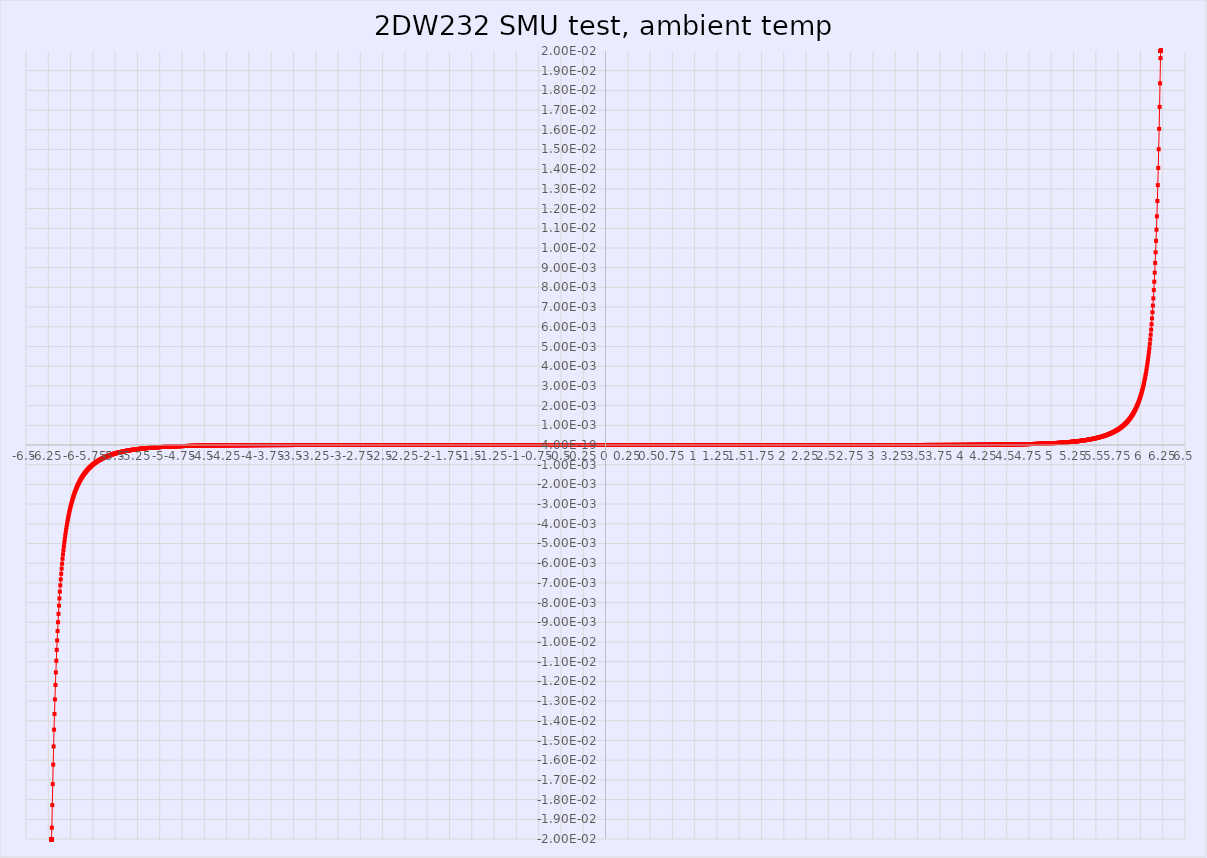
| Category | Series 0 |
|---|---|
| -6.214585 | -0.02 |
| -6.214633 | -0.02 |
| -6.214651 | -0.02 |
| -6.214634 | -0.02 |
| -6.214642 | -0.02 |
| -6.214635 | -0.02 |
| -6.214625 | -0.02 |
| -6.21463 | -0.02 |
| -6.21462 | -0.02 |
| -6.214613 | -0.02 |
| -6.214603 | -0.02 |
| -6.214599 | -0.02 |
| -6.214592 | -0.02 |
| -6.214594 | -0.02 |
| -6.214595 | -0.02 |
| -6.214583 | -0.02 |
| -6.214578 | -0.02 |
| -6.214571 | -0.02 |
| -6.214576 | -0.02 |
| -6.214564 | -0.02 |
| -6.214559 | -0.02 |
| -6.214559 | -0.02 |
| -6.214554 | -0.02 |
| -6.214546 | -0.02 |
| -6.214539 | -0.02 |
| -6.21454 | -0.02 |
| -6.214527 | -0.02 |
| -6.214523 | -0.02 |
| -6.214518 | -0.02 |
| -6.214504 | -0.02 |
| -6.214501 | -0.02 |
| -6.214491 | -0.02 |
| -6.214497 | -0.02 |
| -6.21449 | -0.02 |
| -6.2145 | -0.02 |
| -6.214495 | -0.02 |
| -6.214493 | -0.02 |
| -6.214492 | -0.02 |
| -6.214477 | -0.02 |
| -6.21448 | -0.02 |
| -6.214465 | -0.02 |
| -6.214468 | -0.02 |
| -6.214461 | -0.02 |
| -6.214468 | -0.02 |
| -6.214453 | -0.02 |
| -6.21444 | -0.02 |
| -6.214441 | -0.02 |
| -6.214434 | -0.02 |
| -6.214435 | -0.02 |
| -6.214417 | -0.02 |
| -6.214422 | -0.02 |
| -6.214409 | -0.02 |
| -6.214413 | -0.02 |
| -6.214407 | -0.02 |
| -6.214402 | -0.02 |
| -6.21439 | -0.02 |
| -6.214389 | -0.02 |
| -6.214383 | -0.02 |
| -6.21439 | -0.02 |
| -6.21438 | -0.02 |
| -6.214374 | -0.02 |
| -6.214362 | -0.02 |
| -6.214366 | -0.02 |
| -6.214349 | -0.02 |
| -6.214359 | -0.02 |
| -6.214346 | -0.02 |
| -6.214358 | -0.02 |
| -6.214333 | -0.02 |
| -6.214341 | -0.02 |
| -6.214346 | -0.02 |
| -6.214333 | -0.02 |
| -6.214327 | -0.02 |
| -6.214322 | -0.02 |
| -6.21432 | -0.02 |
| -6.214315 | -0.02 |
| -6.214311 | -0.02 |
| -6.214308 | -0.02 |
| -6.214301 | -0.02 |
| -6.214294 | -0.02 |
| -6.214285 | -0.02 |
| -6.214285 | -0.02 |
| -6.214288 | -0.02 |
| -6.214275 | -0.02 |
| -6.214272 | -0.02 |
| -6.214274 | -0.02 |
| -6.214264 | -0.02 |
| -6.214272 | -0.02 |
| -6.214243 | -0.02 |
| -6.21426 | -0.02 |
| -6.214259 | -0.02 |
| -6.214242 | -0.02 |
| -6.214244 | -0.02 |
| -6.214237 | -0.02 |
| -6.214226 | -0.02 |
| -6.214221 | -0.02 |
| -6.21422 | -0.02 |
| -6.214211 | -0.02 |
| -6.214207 | -0.02 |
| -6.214203 | -0.02 |
| -6.214191 | -0.02 |
| -6.214191 | -0.02 |
| -6.21419 | -0.02 |
| -6.214183 | -0.02 |
| -6.214176 | -0.02 |
| -6.214179 | -0.02 |
| -6.214171 | -0.02 |
| -6.214168 | -0.02 |
| -6.21416 | -0.02 |
| -6.214156 | -0.02 |
| -6.214153 | -0.02 |
| -6.214157 | -0.02 |
| -6.214156 | -0.02 |
| -6.214143 | -0.02 |
| -6.21414 | -0.02 |
| -6.214136 | -0.02 |
| -6.214133 | -0.02 |
| -6.214126 | -0.02 |
| -6.214122 | -0.02 |
| -6.214113 | -0.02 |
| -6.214111 | -0.02 |
| -6.214103 | -0.02 |
| -6.214097 | -0.02 |
| -6.214103 | -0.02 |
| -6.214085 | -0.02 |
| -6.214083 | -0.02 |
| -6.214079 | -0.02 |
| -6.214077 | -0.02 |
| -6.214067 | -0.02 |
| -6.21405 | -0.02 |
| -6.214053 | -0.02 |
| -6.214056 | -0.02 |
| -6.214052 | -0.02 |
| -6.214047 | -0.02 |
| -6.214043 | -0.02 |
| -6.21404 | -0.02 |
| -6.21404 | -0.02 |
| -6.21403 | -0.02 |
| -6.214032 | -0.02 |
| -6.214024 | -0.02 |
| -6.214023 | -0.02 |
| -6.214022 | -0.02 |
| -6.214008 | -0.02 |
| -6.214015 | -0.02 |
| -6.213993 | -0.02 |
| -6.213997 | -0.02 |
| -6.213995 | -0.02 |
| -6.213986 | -0.02 |
| -6.213985 | -0.02 |
| -6.213984 | -0.02 |
| -6.213976 | -0.02 |
| -6.213975 | -0.02 |
| -6.21397 | -0.02 |
| -6.213972 | -0.02 |
| -6.213974 | -0.02 |
| -6.213958 | -0.02 |
| -6.213941 | -0.02 |
| -6.21395 | -0.02 |
| -6.213951 | -0.02 |
| -6.213949 | -0.02 |
| -6.213946 | -0.02 |
| -6.213942 | -0.02 |
| -6.213937 | -0.02 |
| -6.213943 | -0.02 |
| -6.213936 | -0.02 |
| -6.213923 | -0.02 |
| -6.213916 | -0.02 |
| -6.213914 | -0.02 |
| -6.213901 | -0.02 |
| -6.213904 | -0.02 |
| -6.213908 | -0.02 |
| -6.213898 | -0.02 |
| -6.213896 | -0.02 |
| -6.213896 | -0.02 |
| -6.213902 | -0.02 |
| -6.213896 | -0.02 |
| -6.213885 | -0.02 |
| -6.213878 | -0.02 |
| -6.213878 | -0.02 |
| -6.21387 | -0.02 |
| -6.213866 | -0.02 |
| -6.213867 | -0.02 |
| -6.213854 | -0.02 |
| -6.21385 | -0.02 |
| -6.213844 | -0.02 |
| -6.213842 | -0.02 |
| -6.213831 | -0.02 |
| -6.213827 | -0.02 |
| -6.213824 | -0.02 |
| -6.213818 | -0.02 |
| -6.213823 | -0.02 |
| -6.213822 | -0.02 |
| -6.213812 | -0.02 |
| -6.213803 | -0.02 |
| -6.213799 | -0.02 |
| -6.213803 | -0.02 |
| -6.213793 | -0.02 |
| -6.213795 | -0.02 |
| -6.213782 | -0.02 |
| -6.213786 | -0.02 |
| -6.213779 | -0.02 |
| -6.213786 | -0.02 |
| -6.213772 | -0.02 |
| -6.213765 | -0.02 |
| -6.213762 | -0.02 |
| -6.213767 | -0.02 |
| -6.213752 | -0.02 |
| -6.213744 | -0.02 |
| -6.213747 | -0.02 |
| -6.213748 | -0.02 |
| -6.213737 | -0.02 |
| -6.21373 | -0.02 |
| -6.213728 | -0.02 |
| -6.213718 | -0.02 |
| -6.213723 | -0.02 |
| -6.213717 | -0.02 |
| -6.213711 | -0.02 |
| -6.213704 | -0.02 |
| -6.213699 | -0.02 |
| -6.213697 | -0.02 |
| -6.213701 | -0.02 |
| -6.21369 | -0.02 |
| -6.213685 | -0.02 |
| -6.213685 | -0.02 |
| -6.213681 | -0.02 |
| -6.213686 | -0.02 |
| -6.213676 | -0.02 |
| -6.213678 | -0.02 |
| -6.213668 | -0.02 |
| -6.213663 | -0.02 |
| -6.213657 | -0.02 |
| -6.213657 | -0.02 |
| -6.213653 | -0.02 |
| -6.213638 | -0.02 |
| -6.213641 | -0.02 |
| -6.213637 | -0.02 |
| -6.213626 | -0.02 |
| -6.213634 | -0.02 |
| -6.213626 | -0.02 |
| -6.213626 | -0.02 |
| -6.213622 | -0.02 |
| -6.213622 | -0.02 |
| -6.213613 | -0.02 |
| -6.213614 | -0.02 |
| -6.213603 | -0.02 |
| -6.213599 | -0.02 |
| -6.213598 | -0.02 |
| -6.213593 | -0.02 |
| -6.213584 | -0.02 |
| -6.213585 | -0.02 |
| -6.213573 | -0.02 |
| -6.213572 | -0.02 |
| -6.213566 | -0.02 |
| -6.21356 | -0.02 |
| -6.213565 | -0.02 |
| -6.21357 | -0.02 |
| -6.213558 | -0.02 |
| -6.213554 | -0.02 |
| -6.213559 | -0.02 |
| -6.213558 | -0.02 |
| -6.213552 | -0.02 |
| -6.213547 | -0.02 |
| -6.213545 | -0.02 |
| -6.213537 | -0.02 |
| -6.213534 | -0.02 |
| -6.213534 | -0.02 |
| -6.213531 | -0.02 |
| -6.213527 | -0.02 |
| -6.213509 | -0.02 |
| -6.213512 | -0.02 |
| -6.213502 | -0.02 |
| -6.213506 | -0.02 |
| -6.213503 | -0.02 |
| -6.2135 | -0.02 |
| -6.213496 | -0.02 |
| -6.213493 | -0.02 |
| -6.213491 | -0.02 |
| -6.213489 | -0.02 |
| -6.213479 | -0.02 |
| -6.213476 | -0.02 |
| -6.213472 | -0.02 |
| -6.213464 | -0.02 |
| -6.213464 | -0.02 |
| -6.213467 | -0.02 |
| -6.213463 | -0.02 |
| -6.21345 | -0.02 |
| -6.213453 | -0.02 |
| -6.213456 | -0.02 |
| -6.213453 | -0.02 |
| -6.213445 | -0.02 |
| -6.21344 | -0.02 |
| -6.213443 | -0.02 |
| -6.213433 | -0.02 |
| -6.213428 | -0.02 |
| -6.213436 | -0.02 |
| -6.213423 | -0.02 |
| -6.213426 | -0.02 |
| -6.21342 | -0.02 |
| -6.21342 | -0.02 |
| -6.213422 | -0.02 |
| -6.213407 | -0.02 |
| -6.213414 | -0.02 |
| -6.213411 | -0.02 |
| -6.213415 | -0.02 |
| -6.213417 | -0.02 |
| -6.213404 | -0.02 |
| -6.2134 | -0.02 |
| -6.213393 | -0.02 |
| -6.213398 | -0.02 |
| -6.213401 | -0.02 |
| -6.213387 | -0.02 |
| -6.21337 | -0.02 |
| -6.213384 | -0.02 |
| -6.213382 | -0.02 |
| -6.213377 | -0.02 |
| -6.213378 | -0.02 |
| -6.213365 | -0.02 |
| -6.213358 | -0.02 |
| -6.213351 | -0.02 |
| -6.213353 | -0.02 |
| -6.213351 | -0.02 |
| -6.213346 | -0.02 |
| -6.213343 | -0.02 |
| -6.213342 | -0.02 |
| -6.213325 | -0.02 |
| -6.213325 | -0.02 |
| -6.213327 | -0.02 |
| -6.213325 | -0.02 |
| -6.213319 | -0.02 |
| -6.213328 | -0.02 |
| -6.213309 | -0.02 |
| -6.213312 | -0.02 |
| -6.213299 | -0.02 |
| -6.213293 | -0.02 |
| -6.213305 | -0.02 |
| -6.213304 | -0.02 |
| -6.2133 | -0.02 |
| -6.213293 | -0.02 |
| -6.21329 | -0.02 |
| -6.213288 | -0.02 |
| -6.213285 | -0.02 |
| -6.213289 | -0.02 |
| -6.213286 | -0.02 |
| -6.21328 | -0.02 |
| -6.213272 | -0.02 |
| -6.213268 | -0.02 |
| -6.21327 | -0.02 |
| -6.213265 | -0.02 |
| -6.213256 | -0.02 |
| -6.21326 | -0.02 |
| -6.213265 | -0.02 |
| -6.21326 | -0.02 |
| -6.213254 | -0.02 |
| -6.213258 | -0.02 |
| -6.213241 | -0.02 |
| -6.21324 | -0.02 |
| -6.213236 | -0.02 |
| -6.213233 | -0.02 |
| -6.213238 | -0.02 |
| -6.213231 | -0.02 |
| -6.213224 | -0.02 |
| -6.213224 | -0.02 |
| -6.213224 | -0.02 |
| -6.213222 | -0.02 |
| -6.21322 | -0.02 |
| -6.213223 | -0.02 |
| -6.213227 | -0.02 |
| -6.213208 | -0.02 |
| -6.213209 | -0.02 |
| -6.213212 | -0.02 |
| -6.213202 | -0.02 |
| -6.213207 | -0.02 |
| -6.2132 | -0.02 |
| -6.213196 | -0.02 |
| -6.213191 | -0.02 |
| -6.213197 | -0.02 |
| -6.213191 | -0.02 |
| -6.213191 | -0.02 |
| -6.213182 | -0.02 |
| -6.213188 | -0.02 |
| -6.213186 | -0.02 |
| -6.213178 | -0.02 |
| -6.21317 | -0.02 |
| -6.213169 | -0.02 |
| -6.21316 | -0.02 |
| -6.213159 | -0.02 |
| -6.213161 | -0.02 |
| -6.213159 | -0.02 |
| -6.213152 | -0.02 |
| -6.213153 | -0.02 |
| -6.213147 | -0.02 |
| -6.213144 | -0.02 |
| -6.213141 | -0.02 |
| -6.213137 | -0.02 |
| -6.213138 | -0.02 |
| -6.213136 | -0.02 |
| -6.213129 | -0.02 |
| -6.213122 | -0.02 |
| -6.213116 | -0.02 |
| -6.213123 | -0.02 |
| -6.213119 | -0.02 |
| -6.213113 | -0.02 |
| -6.21312 | -0.02 |
| -6.213114 | -0.02 |
| -6.213116 | -0.02 |
| -6.213109 | -0.02 |
| -6.213097 | -0.02 |
| -6.213101 | -0.02 |
| -6.21311 | -0.02 |
| -6.213102 | -0.02 |
| -6.213095 | -0.02 |
| -6.213087 | -0.02 |
| -6.213092 | -0.02 |
| -6.213099 | -0.02 |
| -6.213088 | -0.02 |
| -6.213087 | -0.02 |
| -6.213093 | -0.02 |
| -6.213093 | -0.02 |
| -6.213083 | -0.02 |
| -6.213082 | -0.02 |
| -6.213081 | -0.02 |
| -6.213079 | -0.02 |
| -6.213074 | -0.02 |
| -6.213073 | -0.02 |
| -6.213078 | -0.02 |
| -6.21306 | -0.02 |
| -6.213058 | -0.02 |
| -6.213067 | -0.02 |
| -6.213063 | -0.02 |
| -6.213065 | -0.02 |
| -6.213061 | -0.02 |
| -6.213053 | -0.02 |
| -6.213052 | -0.02 |
| -6.213041 | -0.02 |
| -6.213039 | -0.02 |
| -6.213043 | -0.02 |
| -6.213049 | -0.02 |
| -6.213043 | -0.02 |
| -6.213048 | -0.02 |
| -6.213035 | -0.02 |
| -6.213037 | -0.02 |
| -6.213036 | -0.02 |
| -6.213034 | -0.02 |
| -6.213041 | -0.02 |
| -6.213029 | -0.02 |
| -6.21303 | -0.02 |
| -6.213017 | -0.02 |
| -6.213033 | -0.02 |
| -6.213026 | -0.02 |
| -6.213018 | -0.02 |
| -6.213018 | -0.02 |
| -6.213017 | -0.02 |
| -6.213013 | -0.02 |
| -6.213009 | -0.02 |
| -6.213013 | -0.02 |
| -6.213017 | -0.02 |
| -6.213001 | -0.02 |
| -6.213004 | -0.02 |
| -6.212992 | -0.02 |
| -6.212997 | -0.02 |
| -6.212996 | -0.02 |
| -6.213001 | -0.02 |
| -6.212992 | -0.02 |
| -6.212988 | -0.02 |
| -6.212982 | -0.02 |
| -6.21299 | -0.02 |
| -6.212977 | -0.02 |
| -6.212957 | -0.02 |
| -6.212974 | -0.02 |
| -6.212971 | -0.02 |
| -6.212967 | -0.02 |
| -6.212977 | -0.02 |
| -6.212973 | -0.02 |
| -6.212975 | -0.02 |
| -6.212964 | -0.02 |
| -6.212967 | -0.02 |
| -6.21296 | -0.02 |
| -6.21295 | -0.02 |
| -6.212951 | -0.02 |
| -6.212954 | -0.02 |
| -6.212948 | -0.02 |
| -6.212947 | -0.02 |
| -6.212943 | -0.02 |
| -6.21294 | -0.02 |
| -6.212943 | -0.02 |
| -6.212928 | -0.02 |
| -6.212931 | -0.02 |
| -6.212934 | -0.02 |
| -6.212942 | -0.02 |
| -6.212929 | -0.02 |
| -6.212934 | -0.02 |
| -6.212937 | -0.02 |
| -6.212929 | -0.02 |
| -6.212921 | -0.02 |
| -6.212909 | -0.02 |
| -6.212919 | -0.02 |
| -6.212914 | -0.02 |
| -6.212906 | -0.02 |
| -6.212906 | -0.02 |
| -6.212903 | -0.02 |
| -6.21291 | -0.02 |
| -6.212905 | -0.02 |
| -6.212913 | -0.02 |
| -6.212912 | -0.02 |
| -6.212893 | -0.02 |
| -6.212907 | -0.02 |
| -6.212903 | -0.02 |
| -6.212896 | -0.02 |
| -6.212894 | -0.02 |
| -6.212902 | -0.02 |
| -6.212903 | -0.02 |
| -6.212903 | -0.02 |
| -6.212879 | -0.02 |
| -6.212879 | -0.02 |
| -6.21289 | -0.02 |
| -6.21288 | -0.02 |
| -6.212872 | -0.02 |
| -6.21287 | -0.02 |
| -6.212872 | -0.02 |
| -6.212873 | -0.02 |
| -6.212866 | -0.02 |
| -6.212862 | -0.02 |
| -6.212862 | -0.02 |
| -6.212867 | -0.02 |
| -6.212857 | -0.02 |
| -6.212854 | -0.02 |
| -6.212847 | -0.02 |
| -6.212849 | -0.02 |
| -6.212845 | -0.02 |
| -6.212844 | -0.02 |
| -6.212847 | -0.02 |
| -6.212841 | -0.02 |
| -6.21284 | -0.02 |
| -6.212837 | -0.02 |
| -6.212831 | -0.02 |
| -6.212837 | -0.02 |
| -6.212831 | -0.02 |
| -6.212827 | -0.02 |
| -6.212818 | -0.02 |
| -6.212825 | -0.02 |
| -6.212821 | -0.02 |
| -6.212812 | -0.02 |
| -6.212802 | -0.02 |
| -6.212814 | -0.02 |
| -6.212811 | -0.02 |
| -6.212801 | -0.02 |
| -6.212807 | -0.02 |
| -6.212798 | -0.02 |
| -6.212789 | -0.02 |
| -6.212787 | -0.02 |
| -6.212785 | -0.02 |
| -6.212781 | -0.02 |
| -6.212786 | -0.02 |
| -6.212777 | -0.02 |
| -6.21277 | -0.02 |
| -6.212773 | -0.02 |
| -6.212768 | -0.02 |
| -6.212776 | -0.02 |
| -6.21277 | -0.02 |
| -6.212762 | -0.02 |
| -6.212767 | -0.02 |
| -6.21277 | -0.02 |
| -6.212768 | -0.02 |
| -6.212762 | -0.02 |
| -6.212754 | -0.02 |
| -6.212747 | -0.02 |
| -6.21275 | -0.02 |
| -6.212747 | -0.02 |
| -6.21275 | -0.02 |
| -6.21275 | -0.02 |
| -6.212748 | -0.02 |
| -6.212749 | -0.02 |
| -6.212738 | -0.02 |
| -6.21274 | -0.02 |
| -6.21275 | -0.02 |
| -6.212744 | -0.02 |
| -6.21274 | -0.02 |
| -6.212736 | -0.02 |
| -6.212735 | -0.02 |
| -6.212739 | -0.02 |
| -6.212734 | -0.02 |
| -6.212734 | -0.02 |
| -6.212736 | -0.02 |
| -6.212725 | -0.02 |
| -6.212726 | -0.02 |
| -6.212733 | -0.02 |
| -6.212734 | -0.02 |
| -6.212729 | -0.02 |
| -6.212722 | -0.02 |
| -6.212727 | -0.02 |
| -6.212724 | -0.02 |
| -6.212713 | -0.02 |
| -6.212726 | -0.02 |
| -6.212723 | -0.02 |
| -6.212716 | -0.02 |
| -6.212717 | -0.02 |
| -6.212718 | -0.02 |
| -6.21271 | -0.02 |
| -6.212703 | -0.02 |
| -6.212706 | -0.02 |
| -6.212699 | -0.02 |
| -6.212696 | -0.02 |
| -6.212708 | -0.02 |
| -6.212692 | -0.02 |
| -6.212697 | -0.02 |
| -6.212707 | -0.02 |
| -6.212698 | -0.02 |
| -6.212703 | -0.02 |
| -6.212686 | -0.02 |
| -6.212694 | -0.02 |
| -6.2127 | -0.02 |
| -6.212699 | -0.02 |
| -6.212691 | -0.02 |
| -6.212689 | -0.02 |
| -6.212677 | -0.02 |
| -6.212692 | -0.02 |
| -6.212689 | -0.02 |
| -6.212689 | -0.02 |
| -6.212677 | -0.02 |
| -6.212676 | -0.02 |
| -6.212673 | -0.02 |
| -6.212681 | -0.02 |
| -6.212666 | -0.02 |
| -6.212667 | -0.02 |
| -6.212659 | -0.02 |
| -6.212666 | -0.02 |
| -6.212653 | -0.02 |
| -6.212647 | -0.02 |
| -6.212651 | -0.02 |
| -6.212652 | -0.02 |
| -6.212645 | -0.02 |
| -6.212653 | -0.02 |
| -6.212646 | -0.02 |
| -6.212644 | -0.02 |
| -6.212644 | -0.02 |
| -6.212637 | -0.02 |
| -6.212637 | -0.02 |
| -6.212612 | -0.02 |
| -6.212628 | -0.02 |
| -6.212621 | -0.02 |
| -6.212613 | -0.02 |
| -6.212618 | -0.02 |
| -6.212628 | -0.02 |
| -6.212621 | -0.02 |
| -6.212617 | -0.02 |
| -6.212617 | -0.02 |
| -6.212626 | -0.02 |
| -6.212621 | -0.02 |
| -6.212617 | -0.02 |
| -6.212623 | -0.02 |
| -6.212621 | -0.02 |
| -6.21262 | -0.02 |
| -6.212607 | -0.02 |
| -6.212616 | -0.02 |
| -6.212614 | -0.02 |
| -6.212607 | -0.02 |
| -6.212607 | -0.02 |
| -6.212611 | -0.02 |
| -6.212613 | -0.02 |
| -6.212607 | -0.02 |
| -6.212604 | -0.02 |
| -6.212603 | -0.02 |
| -6.212597 | -0.02 |
| -6.212601 | -0.02 |
| -6.212588 | -0.02 |
| -6.212592 | -0.02 |
| -6.212594 | -0.02 |
| -6.212592 | -0.02 |
| -6.212584 | -0.02 |
| -6.212587 | -0.02 |
| -6.212593 | -0.02 |
| -6.212586 | -0.02 |
| -6.212595 | -0.02 |
| -6.212587 | -0.02 |
| -6.21258 | -0.02 |
| -6.212578 | -0.02 |
| -6.212579 | -0.02 |
| -6.212574 | -0.02 |
| -6.212576 | -0.02 |
| -6.212577 | -0.02 |
| -6.212572 | -0.02 |
| -6.212562 | -0.02 |
| -6.212553 | -0.02 |
| -6.212558 | -0.02 |
| -6.212554 | -0.02 |
| -6.212557 | -0.02 |
| -6.212543 | -0.02 |
| -6.212552 | -0.02 |
| -6.212544 | -0.02 |
| -6.212551 | -0.02 |
| -6.212547 | -0.02 |
| -6.212542 | -0.02 |
| -6.212546 | -0.02 |
| -6.212552 | -0.02 |
| -6.212543 | -0.02 |
| -6.21254 | -0.02 |
| -6.21254 | -0.02 |
| -6.212532 | -0.02 |
| -6.21253 | -0.02 |
| -6.212536 | -0.02 |
| -6.21254 | -0.02 |
| -6.212526 | -0.02 |
| -6.21254 | -0.02 |
| -6.212524 | -0.02 |
| -6.212533 | -0.02 |
| -6.212527 | -0.02 |
| -6.212531 | -0.02 |
| -6.212526 | -0.02 |
| -6.212537 | -0.02 |
| -6.21252 | -0.02 |
| -6.212528 | -0.02 |
| -6.212524 | -0.02 |
| -6.212526 | -0.02 |
| -6.212525 | -0.02 |
| -6.212523 | -0.02 |
| -6.212531 | -0.02 |
| -6.212513 | -0.02 |
| -6.212516 | -0.02 |
| -6.212513 | -0.02 |
| -6.212522 | -0.02 |
| -6.212514 | -0.02 |
| -6.212516 | -0.02 |
| -6.21251 | -0.02 |
| -6.212506 | -0.02 |
| -6.212504 | -0.02 |
| -6.212507 | -0.02 |
| -6.212503 | -0.02 |
| -6.212489 | -0.02 |
| -6.212499 | -0.02 |
| -6.212499 | -0.02 |
| -6.212492 | -0.02 |
| -6.212487 | -0.02 |
| -6.212494 | -0.02 |
| -6.212484 | -0.02 |
| -6.212477 | -0.02 |
| -6.212481 | -0.02 |
| -6.212486 | -0.02 |
| -6.212479 | -0.02 |
| -6.212466 | -0.02 |
| -6.212472 | -0.02 |
| -6.212475 | -0.02 |
| -6.212476 | -0.02 |
| -6.212465 | -0.02 |
| -6.212469 | -0.02 |
| -6.212468 | -0.02 |
| -6.212466 | -0.02 |
| -6.212463 | -0.02 |
| -6.21247 | -0.02 |
| -6.212454 | -0.02 |
| -6.212451 | -0.02 |
| -6.212458 | -0.02 |
| -6.212447 | -0.02 |
| -6.212441 | -0.02 |
| -6.21246 | -0.02 |
| -6.212452 | -0.02 |
| -6.212441 | -0.02 |
| -6.212443 | -0.02 |
| -6.21244 | -0.02 |
| -6.212449 | -0.02 |
| -6.210035 | -0.019 |
| -6.205078 | -0.018 |
| -6.200113 | -0.017 |
| -6.195152 | -0.016 |
| -6.190187 | -0.015 |
| -6.185236 | -0.014 |
| -6.180278 | -0.014 |
| -6.175317 | -0.013 |
| -6.170011 | -0.012 |
| -6.16505 | -0.012 |
| -6.160098 | -0.011 |
| -6.155131 | -0.01 |
| -6.150424 | -0.01 |
| -6.145463 | -0.009 |
| -6.140485 | -0.009 |
| -6.135529 | -0.009 |
| -6.130217 | -0.008 |
| -6.125245 | -0.008 |
| -6.120279 | -0.007 |
| -6.11532 | -0.007 |
| -6.110346 | -0.007 |
| -6.105357 | -0.007 |
| -6.100397 | -0.006 |
| -6.095423 | -0.006 |
| -6.090139 | -0.006 |
| -6.085163 | -0.006 |
| -6.080205 | -0.005 |
| -6.075241 | -0.005 |
| -6.070268 | -0.005 |
| -6.065279 | -0.005 |
| -6.060311 | -0.005 |
| -6.055352 | -0.004 |
| -6.050387 | -0.004 |
| -6.045079 | -0.004 |
| -6.040125 | -0.004 |
| -6.035155 | -0.004 |
| -6.0302 | -0.004 |
| -6.025235 | -0.004 |
| -6.020282 | -0.004 |
| -6.015318 | -0.003 |
| -6.010358 | -0.003 |
| -6.005075 | -0.003 |
| -6.000105 | -0.003 |
| -5.995148 | -0.003 |
| -5.990186 | -0.003 |
| -5.985232 | -0.003 |
| -5.980236 | -0.003 |
| -5.975288 | -0.003 |
| -5.970322 | -0.003 |
| -5.965026 | -0.003 |
| -5.960056 | -0.003 |
| -5.955103 | -0.002 |
| -5.950144 | -0.002 |
| -5.945186 | -0.002 |
| -5.940195 | -0.002 |
| -5.935251 | -0.002 |
| -5.930287 | -0.002 |
| -5.924995 | -0.002 |
| -5.920043 | -0.002 |
| -5.915062 | -0.002 |
| -5.910115 | -0.002 |
| -5.905155 | -0.002 |
| -5.900191 | -0.002 |
| -5.895198 | -0.002 |
| -5.890235 | -0.002 |
| -5.885277 | -0.002 |
| -5.879993 | -0.002 |
| -5.875015 | -0.002 |
| -5.870062 | -0.002 |
| -5.865102 | -0.002 |
| -5.860139 | -0.002 |
| -5.855175 | -0.002 |
| -5.850203 | -0.001 |
| -5.845257 | -0.001 |
| -5.839981 | -0.001 |
| -5.835021 | -0.001 |
| -5.830051 | -0.001 |
| -5.825094 | -0.001 |
| -5.820136 | -0.001 |
| -5.815177 | -0.001 |
| -5.810184 | -0.001 |
| -5.805228 | -0.001 |
| -5.799943 | -0.001 |
| -5.79499 | -0.001 |
| -5.79002 | -0.001 |
| -5.78506 | -0.001 |
| -5.780106 | -0.001 |
| -5.775138 | -0.001 |
| -5.770152 | -0.001 |
| -5.765192 | -0.001 |
| -5.760231 | -0.001 |
| -5.754947 | -0.001 |
| -5.750192 | -0.001 |
| -5.745234 | -0.001 |
| -5.740273 | -0.001 |
| -5.735313 | -0.001 |
| -5.730356 | -0.001 |
| -5.725354 | -0.001 |
| -5.72039 | -0.001 |
| -5.715094 | -0.001 |
| -5.710134 | -0.001 |
| -5.705159 | -0.001 |
| -5.700195 | -0.001 |
| -5.695236 | -0.001 |
| -5.690265 | -0.001 |
| -5.685333 | -0.001 |
| -5.680381 | -0.001 |
| -5.675095 | -0.001 |
| -5.670133 | -0.001 |
| -5.665155 | -0.001 |
| -5.660181 | -0.001 |
| -5.655237 | -0.001 |
| -5.650283 | -0.001 |
| -5.645315 | -0.001 |
| -5.640322 | -0.001 |
| -5.63537 | -0.001 |
| -5.630072 | -0.001 |
| -5.625107 | -0.001 |
| -5.620142 | -0.001 |
| -5.615171 | -0.001 |
| -5.610215 | -0.001 |
| -5.605261 | -0.001 |
| -5.60027 | -0.001 |
| -5.595314 | -0.001 |
| -5.590025 | -0.001 |
| -5.58507 | -0.001 |
| -5.580096 | -0.001 |
| -5.575133 | -0.001 |
| -5.570177 | -0.001 |
| -5.565215 | -0.001 |
| -5.560257 | -0.001 |
| -5.555262 | -0.001 |
| -5.549971 | -0.001 |
| -5.545022 | 0 |
| -5.540057 | 0 |
| -5.535084 | 0 |
| -5.530116 | 0 |
| -5.525163 | 0 |
| -5.520196 | 0 |
| -5.515232 | 0 |
| -5.509949 | 0 |
| -5.504995 | 0 |
| -5.500027 | 0 |
| -5.495059 | 0 |
| -5.490095 | 0 |
| -5.485143 | 0 |
| -5.480185 | 0 |
| -5.475224 | 0 |
| -5.470234 | 0 |
| -5.464946 | 0 |
| -5.459987 | 0 |
| -5.455031 | 0 |
| -5.450062 | 0 |
| -5.445102 | 0 |
| -5.440144 | 0 |
| -5.435184 | 0 |
| -5.430193 | 0 |
| -5.424912 | 0 |
| -5.419949 | 0 |
| -5.414987 | 0 |
| -5.410019 | 0 |
| -5.405066 | 0 |
| -5.400105 | 0 |
| -5.395144 | 0 |
| -5.390152 | 0 |
| -5.384857 | 0 |
| -5.379897 | 0 |
| -5.374937 | 0 |
| -5.369981 | 0 |
| -5.365014 | 0 |
| -5.360046 | 0 |
| -5.355092 | 0 |
| -5.350128 | 0 |
| -5.345156 | 0 |
| -5.339869 | 0 |
| -5.334926 | 0 |
| -5.329965 | 0 |
| -5.325004 | 0 |
| -5.320045 | 0 |
| -5.315088 | 0 |
| -5.310132 | 0 |
| -5.305144 | 0 |
| -5.29986 | 0 |
| -5.294913 | 0 |
| -5.289949 | 0 |
| -5.285008 | 0 |
| -5.280037 | 0 |
| -5.275083 | 0 |
| -5.270129 | 0 |
| -5.265175 | 0 |
| -5.259853 | 0 |
| -5.254897 | 0 |
| -5.249951 | 0 |
| -5.244995 | 0 |
| -5.240025 | 0 |
| -5.235078 | 0 |
| -5.230124 | 0 |
| -5.225169 | 0 |
| -5.219849 | 0 |
| -5.214885 | 0 |
| -5.209933 | 0 |
| -5.204984 | 0 |
| -5.200026 | 0 |
| -5.195063 | 0 |
| -5.190108 | 0 |
| -5.185148 | 0 |
| -5.180191 | 0 |
| -5.174902 | 0 |
| -5.169945 | 0 |
| -5.164998 | 0 |
| -5.160048 | 0 |
| -5.155077 | 0 |
| -5.150129 | 0 |
| -5.145167 | 0 |
| -5.140216 | 0 |
| -5.13489 | 0 |
| -5.129936 | 0 |
| -5.124987 | 0 |
| -5.120028 | 0 |
| -5.11505 | 0 |
| -5.110111 | 0 |
| -5.105155 | 0 |
| -5.100191 | 0 |
| -5.094913 | 0 |
| -5.089921 | 0 |
| -5.084972 | 0 |
| -5.080021 | 0 |
| -5.075068 | 0 |
| -5.070107 | 0 |
| -5.065145 | 0 |
| -5.06019 | 0 |
| -5.055236 | 0 |
| -5.049908 | 0 |
| -5.04496 | 0 |
| -5.040007 | 0 |
| -5.035048 | 0 |
| -5.030087 | 0 |
| -5.025125 | 0 |
| -5.020169 | 0 |
| -5.015216 | 0 |
| -5.009927 | 0 |
| -5.005001 | 0 |
| -5.000042 | 0 |
| -4.995094 | 0 |
| -4.990131 | 0 |
| -4.985178 | 0 |
| -4.980224 | 0 |
| -4.975267 | 0 |
| -4.970196 | 0 |
| -4.965203 | 0 |
| -4.960251 | 0 |
| -4.955295 | 0 |
| -4.950345 | 0 |
| -4.945366 | 0 |
| -4.940414 | 0 |
| -4.93546 | 0 |
| -4.93049 | 0 |
| -4.925195 | 0 |
| -4.920222 | 0 |
| -4.915264 | 0 |
| -4.910321 | 0 |
| -4.905352 | 0 |
| -4.900382 | 0 |
| -4.895428 | 0 |
| -4.890467 | 0 |
| -4.885183 | 0 |
| -4.880192 | 0 |
| -4.875227 | 0 |
| -4.870274 | 0 |
| -4.86532 | 0 |
| -4.86035 | 0 |
| -4.855396 | 0 |
| -4.850434 | 0 |
| -4.845148 | 0 |
| -4.840178 | 0 |
| -4.835233 | 0 |
| -4.83027 | 0 |
| -4.825312 | 0 |
| -4.820362 | 0 |
| -4.815395 | 0 |
| -4.810438 | 0 |
| -4.805154 | 0 |
| -4.800194 | 0 |
| -4.795203 | 0 |
| -4.790247 | 0 |
| -4.78529 | 0 |
| -4.780346 | 0 |
| -4.775373 | 0 |
| -4.770413 | 0 |
| -4.765451 | 0 |
| -4.760168 | 0 |
| -4.755178 | 0 |
| -4.750221 | 0 |
| -4.745268 | 0 |
| -4.740315 | 0 |
| -4.735364 | 0 |
| -4.730388 | 0 |
| -4.725432 | 0 |
| -4.720149 | 0 |
| -4.715193 | 0 |
| -4.710195 | 0 |
| -4.705244 | 0 |
| -4.700289 | 0 |
| -4.695335 | 0 |
| -4.690361 | 0 |
| -4.685409 | 0 |
| -4.68011 | 0 |
| -4.675155 | 0 |
| -4.670199 | 0 |
| -4.665243 | 0 |
| -4.66029 | 0 |
| -4.655343 | 0 |
| -4.650382 | 0 |
| -4.645413 | 0 |
| -4.640464 | 0 |
| -4.635179 | 0 |
| -4.630218 | 0 |
| -4.625235 | 0 |
| -4.620284 | 0 |
| -4.615326 | 0 |
| -4.610368 | 0 |
| -4.605396 | 0 |
| -4.600448 | 0 |
| -4.595154 | 0 |
| -4.590199 | 0 |
| -4.585212 | 0 |
| -4.580261 | 0 |
| -4.575301 | 0 |
| -4.570351 | 0 |
| -4.565397 | 0 |
| -4.560436 | 0 |
| -4.555144 | 0 |
| -4.550189 | 0 |
| -4.545235 | 0 |
| -4.540241 | 0 |
| -4.53529 | 0 |
| -4.530333 | 0 |
| -4.525381 | 0 |
| -4.520415 | 0 |
| -4.515131 | 0 |
| -4.51017 | 0 |
| -4.505211 | 0 |
| -4.500245 | 0 |
| -4.495286 | 0 |
| -4.490339 | 0 |
| -4.485381 | 0 |
| -4.480417 | 0 |
| -4.475468 | 0 |
| -4.470171 | 0 |
| -4.465224 | 0 |
| -4.460261 | 0 |
| -4.455271 | 0 |
| -4.450323 | 0 |
| -4.445374 | 0 |
| -4.440418 | 0 |
| -4.43544 | 0 |
| -4.430156 | 0 |
| -4.425206 | 0 |
| -4.420252 | 0 |
| -4.415259 | 0 |
| -4.410306 | 0 |
| -4.405348 | 0 |
| -4.4004 | 0 |
| -4.395432 | 0 |
| -4.390144 | 0 |
| -4.385187 | 0 |
| -4.380235 | 0 |
| -4.375271 | 0 |
| -4.370288 | 0 |
| -4.365335 | 0 |
| -4.360386 | 0 |
| -4.355434 | 0 |
| -4.35046 | 0 |
| -4.345175 | 0 |
| -4.340222 | 0 |
| -4.335259 | 0 |
| -4.330328 | 0 |
| -4.325378 | 0 |
| -4.320419 | 0 |
| -4.315463 | 0 |
| -4.310493 | 0 |
| -4.305217 | 0 |
| -4.300254 | 0 |
| -4.295303 | 0 |
| -4.290343 | 0 |
| -4.285362 | 0 |
| -4.280407 | 0 |
| -4.275458 | 0 |
| -4.270497 | 0 |
| -4.265205 | 0 |
| -4.260253 | 0 |
| -4.255289 | 0 |
| -4.250329 | 0 |
| -4.245346 | 0 |
| -4.240397 | 0 |
| -4.23544 | 0 |
| -4.23049 | 0 |
| -4.225524 | 0 |
| -4.220241 | 0 |
| -4.215285 | 0 |
| -4.210328 | 0 |
| -4.205335 | 0 |
| -4.200379 | 0 |
| -4.195435 | 0 |
| -4.190476 | 0 |
| -4.185528 | 0 |
| -4.180225 | 0 |
| -4.175263 | 0 |
| -4.170313 | 0 |
| -4.165349 | 0 |
| -4.160383 | 0 |
| -4.155436 | 0 |
| -4.150478 | 0 |
| -4.145523 | 0 |
| -4.140226 | 0 |
| -4.135274 | 0 |
| -4.130322 | 0 |
| -4.125365 | 0 |
| -4.120369 | 0 |
| -4.115401 | 0 |
| -4.110457 | 0 |
| -4.105726 | 0 |
| -4.100427 | 0 |
| -4.095463 | 0 |
| -4.090498 | 0 |
| -4.085544 | 0 |
| -4.080587 | 0 |
| -4.075599 | 0 |
| -4.070643 | 0 |
| -4.065679 | 0 |
| -4.06074 | 0 |
| -4.055428 | 0 |
| -4.050476 | 0 |
| -4.045515 | 0 |
| -4.040549 | 0 |
| -4.035561 | 0 |
| -4.030603 | 0 |
| -4.025651 | 0 |
| -4.020697 | 0 |
| -4.015398 | 0 |
| -4.010437 | 0 |
| -4.005471 | 0 |
| -4.00052 | 0 |
| -3.995545 | 0 |
| -3.99057 | 0 |
| -3.985613 | 0 |
| -3.980654 | 0 |
| -3.975367 | 0 |
| -3.970404 | 0 |
| -3.96544 | 0 |
| -3.960484 | 0 |
| -3.955526 | 0 |
| -3.950528 | 0 |
| -3.945564 | 0 |
| -3.940604 | 0 |
| -3.93565 | 0 |
| -3.930349 | 0 |
| -3.925393 | 0 |
| -3.920428 | 0 |
| -3.915468 | 0 |
| -3.910511 | 0 |
| -3.905526 | 0 |
| -3.900566 | 0 |
| -3.89561 | 0 |
| -3.890321 | 0 |
| -3.885353 | 0 |
| -3.880398 | 0 |
| -3.875432 | 0 |
| -3.870475 | 0 |
| -3.865484 | 0 |
| -3.860526 | 0 |
| -3.855572 | 0 |
| -3.850276 | 0 |
| -3.8453 | 0 |
| -3.84034 | 0 |
| -3.83539 | 0 |
| -3.830427 | 0 |
| -3.825468 | 0 |
| -3.820502 | 0 |
| -3.815543 | 0 |
| -3.810256 | 0 |
| -3.805291 | 0 |
| -3.800322 | 0 |
| -3.795365 | 0 |
| -3.790408 | 0 |
| -3.785452 | 0 |
| -3.78046 | 0 |
| -3.775496 | 0 |
| -3.770549 | 0 |
| -3.765259 | 0 |
| -3.76029 | 0 |
| -3.755326 | 0 |
| -3.750368 | 0 |
| -3.745412 | 0 |
| -3.740451 | 0 |
| -3.735464 | 0 |
| -3.730505 | 0 |
| -3.725226 | 0 |
| -3.720269 | 0 |
| -3.715295 | 0 |
| -3.71034 | 0 |
| -3.705383 | 0 |
| -3.700421 | 0 |
| -3.69543 | 0 |
| -3.690471 | 0 |
| -3.68518 | 0 |
| -3.680218 | 0 |
| -3.67525 | 0 |
| -3.670296 | 0 |
| -3.665337 | 0 |
| -3.660386 | 0 |
| -3.655415 | 0 |
| -3.650477 | 0 |
| -3.645528 | 0 |
| -3.640244 | 0 |
| -3.635289 | 0 |
| -3.630324 | 0 |
| -3.625368 | 0 |
| -3.620409 | 0 |
| -3.615442 | 0 |
| -3.61046 | 0 |
| -3.605495 | 0 |
| -3.600206 | 0 |
| -3.595254 | 0 |
| -3.590288 | 0 |
| -3.58533 | 0 |
| -3.580376 | 0 |
| -3.575411 | 0 |
| -3.570428 | 0 |
| -3.565477 | 0 |
| -3.560188 | 0 |
| -3.555226 | 0 |
| -3.55027 | 0 |
| -3.545297 | 0 |
| -3.540343 | 0 |
| -3.535389 | 0 |
| -3.530431 | 0 |
| -3.525432 | 0 |
| -3.520483 | 0 |
| -3.515195 | 0 |
| -3.510221 | 0 |
| -3.50526 | 0 |
| -3.500302 | 0 |
| -3.495352 | 0 |
| -3.490398 | 0 |
| -3.485427 | 0 |
| -3.480473 | 0 |
| -3.475183 | 0 |
| -3.470227 | 0 |
| -3.46527 | 0 |
| -3.460299 | 0 |
| -3.455342 | 0 |
| -3.450396 | 0 |
| -3.445434 | 0 |
| -3.440436 | 0 |
| -3.435152 | 0 |
| -3.430194 | 0 |
| -3.425235 | 0 |
| -3.420263 | 0 |
| -3.415306 | 0 |
| -3.410348 | 0 |
| -3.405384 | 0 |
| -3.400403 | 0 |
| -3.395118 | 0 |
| -3.390163 | 0 |
| -3.385211 | 0 |
| -3.380246 | 0 |
| -3.375283 | 0 |
| -3.370319 | 0 |
| -3.365366 | 0 |
| -3.360402 | 0 |
| -3.355623 | 0 |
| -3.350335 | 0 |
| -3.345385 | 0 |
| -3.340416 | 0 |
| -3.33544 | 0 |
| -3.330485 | 0 |
| -3.325521 | 0 |
| -3.320561 | 0 |
| -3.31559 | 0 |
| -3.310308 | 0 |
| -3.305343 | 0 |
| -3.300394 | 0 |
| -3.295423 | 0 |
| -3.290465 | 0 |
| -3.285502 | 0 |
| -3.28054 | 0 |
| -3.275578 | 0 |
| -3.270256 | 0 |
| -3.265292 | 0 |
| -3.260342 | 0 |
| -3.255381 | 0 |
| -3.250409 | 0 |
| -3.24545 | 0 |
| -3.240494 | 0 |
| -3.235529 | 0 |
| -3.230535 | 0 |
| -3.225251 | 0 |
| -3.220291 | 0 |
| -3.215335 | 0 |
| -3.210362 | 0 |
| -3.205403 | 0 |
| -3.200446 | 0 |
| -3.195487 | 0 |
| -3.190529 | 0 |
| -3.185191 | 0 |
| -3.180245 | 0 |
| -3.175288 | 0 |
| -3.170329 | 0 |
| -3.165356 | 0 |
| -3.160395 | 0 |
| -3.155435 | 0 |
| -3.150469 | 0 |
| -3.145179 | 0 |
| -3.14022 | 0 |
| -3.135262 | 0 |
| -3.130302 | 0 |
| -3.125331 | 0 |
| -3.120371 | 0 |
| -3.115416 | 0 |
| -3.110459 | 0 |
| -3.105171 | 0 |
| -3.10018 | 0 |
| -3.095225 | 0 |
| -3.090272 | 0 |
| -3.085299 | 0 |
| -3.080336 | 0 |
| -3.075376 | 0 |
| -3.07042 | 0 |
| -3.065453 | 0 |
| -3.060142 | 0 |
| -3.055182 | 0 |
| -3.050222 | 0 |
| -3.045269 | 0 |
| -3.040295 | 0 |
| -3.035341 | 0 |
| -3.030368 | 0 |
| -3.025422 | 0 |
| -3.020098 | 0 |
| -3.015142 | 0 |
| -3.01018 | 0 |
| -3.005231 | 0 |
| -3.00027 | 0 |
| -2.995301 | 0 |
| -2.990343 | 0 |
| -2.985379 | 0 |
| -2.980082 | 0 |
| -2.97515 | 0 |
| -2.970189 | 0 |
| -2.965242 | 0 |
| -2.960284 | 0 |
| -2.955311 | 0 |
| -2.950362 | 0 |
| -2.945405 | 0 |
| -2.940444 | 0 |
| -2.935116 | 0 |
| -2.930164 | 0 |
| -2.925207 | 0 |
| -2.92025 | 0 |
| -2.915298 | 0 |
| -2.910325 | 0 |
| -2.905363 | 0 |
| -2.900398 | 0 |
| -2.89512 | 0 |
| -2.890134 | 0 |
| -2.885175 | 0 |
| -2.880226 | 0 |
| -2.875273 | 0 |
| -2.870296 | 0 |
| -2.865344 | 0 |
| -2.860387 | 0 |
| -2.855097 | 0 |
| -2.8501 | 0 |
| -2.845155 | 0 |
| -2.84019 | 0 |
| -2.835237 | 0 |
| -2.830267 | 0 |
| -2.8253 | 0 |
| -2.820343 | 0 |
| -2.81505 | 0 |
| -2.810085 | 0 |
| -2.805121 | 0 |
| -2.800155 | 0 |
| -2.795217 | 0 |
| -2.790261 | 0 |
| -2.785288 | 0 |
| -2.780335 | 0 |
| -2.77538 | 0 |
| -2.770092 | 0 |
| -2.7651 | 0 |
| -2.760136 | 0 |
| -2.755183 | 0 |
| -2.750233 | 0 |
| -2.745263 | 0 |
| -2.740299 | 0 |
| -2.735345 | 0 |
| -2.730061 | 0 |
| -2.725096 | 0 |
| -2.720106 | 0 |
| -2.715153 | 0 |
| -2.7102 | 0 |
| -2.705243 | 0 |
| -2.700269 | 0 |
| -2.695311 | 0 |
| -2.690018 | 0 |
| -2.685064 | 0 |
| -2.680071 | 0 |
| -2.675117 | 0 |
| -2.670161 | 0 |
| -2.665204 | 0 |
| -2.66023 | 0 |
| -2.655275 | 0 |
| -2.650323 | 0 |
| -2.64503 | 0 |
| -2.64007 | 0 |
| -2.635091 | 0 |
| -2.630149 | 0 |
| -2.625196 | 0 |
| -2.620237 | 0 |
| -2.615264 | 0 |
| -2.610312 | 0 |
| -2.605026 | 0 |
| -2.60007 | 0 |
| -2.595083 | 0 |
| -2.590129 | 0 |
| -2.585186 | 0 |
| -2.580225 | 0 |
| -2.575258 | 0 |
| -2.5703 | 0 |
| -2.565019 | 0 |
| -2.560069 | 0 |
| -2.555097 | 0 |
| -2.550115 | 0 |
| -2.54516 | 0 |
| -2.540213 | 0 |
| -2.535257 | 0 |
| -2.530297 | 0 |
| -2.525336 | 0 |
| -2.52005 | 0 |
| -2.515092 | 0 |
| -2.510105 | 0 |
| -2.505149 | 0 |
| -2.500198 | 0 |
| -2.495249 | 0 |
| -2.49028 | 0 |
| -2.485327 | 0 |
| -2.480035 | 0 |
| -2.47508 | 0 |
| -2.470114 | 0 |
| -2.465158 | 0 |
| -2.460202 | 0 |
| -2.455249 | 0 |
| -2.450295 | 0 |
| -2.44533 | 0 |
| -2.440042 | 0 |
| -2.435094 | 0 |
| -2.430131 | 0 |
| -2.425138 | 0 |
| -2.420185 | 0 |
| -2.41524 | 0 |
| -2.410286 | 0 |
| -2.405312 | 0 |
| -2.400025 | 0 |
| -2.395068 | 0 |
| -2.390115 | 0 |
| -2.385127 | 0 |
| -2.380185 | 0 |
| -2.375229 | 0 |
| -2.370269 | 0 |
| -2.365313 | 0 |
| -2.360351 | 0 |
| -2.355062 | 0 |
| -2.350104 | 0 |
| -2.34515 | 0 |
| -2.340165 | 0 |
| -2.335201 | 0 |
| -2.330254 | 0 |
| -2.325302 | 0 |
| -2.320324 | 0 |
| -2.315045 | 0 |
| -2.310084 | 0 |
| -2.305137 | 0 |
| -2.300191 | 0 |
| -2.295241 | 0 |
| -2.290289 | 0 |
| -2.285345 | 0 |
| -2.280387 | 0 |
| -2.275095 | 0 |
| -2.270133 | 0 |
| -2.265179 | 0 |
| -2.260223 | 0 |
| -2.255235 | 0 |
| -2.250284 | 0 |
| -2.245337 | 0 |
| -2.240373 | 0 |
| -2.235404 | 0 |
| -2.230123 | 0 |
| -2.225165 | 0 |
| -2.220209 | 0 |
| -2.215227 | 0 |
| -2.210264 | 0 |
| -2.205322 | 0 |
| -2.200372 | 0 |
| -2.195414 | 0 |
| -2.190121 | 0 |
| -2.185156 | 0 |
| -2.180206 | 0 |
| -2.175245 | 0 |
| -2.170248 | 0 |
| -2.165303 | 0 |
| -2.160353 | 0 |
| -2.155395 | 0 |
| -2.150098 | 0 |
| -2.145152 | 0 |
| -2.140195 | 0 |
| -2.135237 | 0 |
| -2.130266 | 0 |
| -2.125305 | 0 |
| -2.120362 | 0 |
| -2.115409 | 0 |
| -2.110122 | 0 |
| -2.105162 | 0 |
| -2.099944 | 0 |
| -2.094954 | 0 |
| -2.089932 | 0 |
| -2.084944 | 0 |
| -2.079953 | 0 |
| -2.074961 | 0 |
| -2.069973 | 0 |
| -2.064951 | 0 |
| -2.059959 | 0 |
| -2.054976 | 0 |
| -2.049985 | 0 |
| -2.044961 | 0 |
| -2.039974 | 0 |
| -2.034982 | 0 |
| -2.029992 | 0 |
| -2.025001 | 0 |
| -2.019971 | 0 |
| -2.01498 | 0 |
| -2.009984 | 0 |
| -2.004992 | 0 |
| -1.999966 | 0 |
| -1.994973 | 0 |
| -1.989979 | 0 |
| -1.984986 | 0 |
| -1.979991 | 0 |
| -1.974965 | 0 |
| -1.969973 | 0 |
| -1.964978 | 0 |
| -1.959983 | 0 |
| -1.954993 | 0 |
| -1.949965 | 0 |
| -1.944972 | 0 |
| -1.93998 | 0 |
| -1.934984 | 0 |
| -1.929958 | 0 |
| -1.924963 | 0 |
| -1.919975 | 0 |
| -1.914982 | 0 |
| -1.909986 | 0 |
| -1.904961 | 0 |
| -1.899967 | 0 |
| -1.894973 | 0 |
| -1.889981 | 0 |
| -1.884959 | 0 |
| -1.879966 | 0 |
| -1.874977 | 0 |
| -1.869988 | 0 |
| -1.864996 | 0 |
| -1.859975 | 0 |
| -1.854987 | 0 |
| -1.849997 | 0 |
| -1.845007 | 0 |
| -1.840017 | 0 |
| -1.834995 | 0 |
| -1.830005 | 0 |
| -1.825014 | 0 |
| -1.820027 | 0 |
| -1.815002 | 0 |
| -1.810013 | 0 |
| -1.805022 | 0 |
| -1.800032 | 0 |
| -1.795043 | 0 |
| -1.79002 | 0 |
| -1.785034 | 0 |
| -1.780043 | 0 |
| -1.775055 | 0 |
| -1.770063 | 0 |
| -1.76504 | 0 |
| -1.76005 | 0 |
| -1.755059 | 0 |
| -1.750065 | 0 |
| -1.745034 | 0 |
| -1.74004 | 0 |
| -1.735048 | 0 |
| -1.730053 | 0 |
| -1.725059 | 0 |
| -1.720032 | 0 |
| -1.71504 | 0 |
| -1.710045 | 0 |
| -1.70505 | 0 |
| -1.700024 | 0 |
| -1.695031 | 0 |
| -1.690033 | 0 |
| -1.685042 | 0 |
| -1.680047 | 0 |
| -1.675018 | 0 |
| -1.670025 | 0 |
| -1.665033 | 0 |
| -1.660037 | 0 |
| -1.655043 | 0 |
| -1.65002 | 0 |
| -1.645024 | 0 |
| -1.640031 | 0 |
| -1.635034 | 0 |
| -1.630007 | 0 |
| -1.625013 | 0 |
| -1.620017 | 0 |
| -1.615029 | 0 |
| -1.610041 | 0 |
| -1.605017 | 0 |
| -1.600031 | 0 |
| -1.595044 | 0 |
| -1.590055 | 0 |
| -1.585033 | 0 |
| -1.580046 | 0 |
| -1.57506 | 0 |
| -1.570072 | 0 |
| -1.565085 | 0 |
| -1.560063 | 0 |
| -1.555075 | 0 |
| -1.550086 | 0 |
| -1.5451 | 0 |
| -1.54011 | 0 |
| -1.535089 | 0 |
| -1.530104 | 0 |
| -1.525112 | 0 |
| -1.520122 | 0 |
| -1.515107 | 0 |
| -1.510118 | 0 |
| -1.50513 | 0 |
| -1.500141 | 0 |
| -1.495153 | 0 |
| -1.490129 | 0 |
| -1.485142 | 0 |
| -1.480148 | 0 |
| -1.475154 | 0 |
| -1.470158 | 0 |
| -1.465132 | 0 |
| -1.46014 | 0 |
| -1.455144 | 0 |
| -1.45015 | 0 |
| -1.445129 | 0 |
| -1.440132 | 0 |
| -1.435138 | 0 |
| -1.430147 | 0 |
| -1.425152 | 0 |
| -1.420124 | 0 |
| -1.41513 | 0 |
| -1.410137 | 0 |
| -1.405144 | 0 |
| -1.400115 | 0 |
| -1.395124 | 0 |
| -1.39013 | 0 |
| -1.385134 | 0 |
| -1.380143 | 0 |
| -1.375117 | 0 |
| -1.370123 | 0 |
| -1.365129 | 0 |
| -1.360138 | 0 |
| -1.355141 | 0 |
| -1.350115 | 0 |
| -1.345121 | 0 |
| -1.34013 | 0 |
| -1.335139 | 0 |
| -1.330112 | 0 |
| -1.325122 | 0 |
| -1.32013 | 0 |
| -1.315136 | 0 |
| -1.310151 | 0 |
| -1.305125 | 0 |
| -1.300132 | 0 |
| -1.295142 | 0 |
| -1.290149 | 0 |
| -1.285125 | 0 |
| -1.280132 | 0 |
| -1.275141 | 0 |
| -1.27015 | 0 |
| -1.265159 | 0 |
| -1.260134 | 0 |
| -1.255142 | 0 |
| -1.25015 | 0 |
| -1.24516 | 0 |
| -1.240169 | 0 |
| -1.235142 | 0 |
| -1.23015 | 0 |
| -1.225161 | 0 |
| -1.220166 | 0 |
| -1.215141 | 0 |
| -1.210146 | 0 |
| -1.20515 | 0 |
| -1.200153 | 0 |
| -1.195157 | 0 |
| -1.19013 | 0 |
| -1.185133 | 0 |
| -1.180136 | 0 |
| -1.175146 | 0 |
| -1.170149 | 0 |
| -1.165118 | 0 |
| -1.160124 | 0 |
| -1.155129 | 0 |
| -1.150134 | 0 |
| -1.145104 | 0 |
| -1.140112 | 0 |
| -1.135114 | 0 |
| -1.130118 | 0 |
| -1.125124 | 0 |
| -1.120095 | 0 |
| -1.115099 | 0 |
| -1.110104 | 0 |
| -1.10511 | 0 |
| -1.100082 | 0 |
| -1.095085 | 0 |
| -1.090091 | 0 |
| -1.085096 | 0 |
| -1.080097 | 0 |
| -1.07507 | 0 |
| -1.070077 | 0 |
| -1.065086 | 0 |
| -1.060094 | 0 |
| -1.055101 | 0 |
| -1.050076 | 0 |
| -1.045084 | 0 |
| -1.040096 | 0 |
| -1.035104 | 0 |
| -1.030078 | 0 |
| -1.025085 | 0 |
| -1.020094 | 0 |
| -1.0151 | 0 |
| -1.010108 | 0 |
| -1.005086 | 0 |
| -1.00009 | 0 |
| -0.995099 | 0 |
| -0.990108 | 0 |
| -0.985082 | 0 |
| -0.98009 | 0 |
| -0.975096 | 0 |
| -0.970107 | 0 |
| -0.965115 | 0 |
| -0.960088 | 0 |
| -0.955098 | 0 |
| -0.950105 | 0 |
| -0.94511 | 0 |
| -0.940116 | 0 |
| -0.935086 | 0 |
| -0.930089 | 0 |
| -0.925094 | 0 |
| -0.920099 | 0 |
| -0.915068 | 0 |
| -0.910073 | 0 |
| -0.90508 | 0 |
| -0.900083 | 0 |
| -0.895088 | 0 |
| -0.890058 | 0 |
| -0.885062 | 0 |
| -0.880068 | 0 |
| -0.87507 | 0 |
| -0.870077 | 0 |
| -0.865048 | 0 |
| -0.860049 | 0 |
| -0.855055 | 0 |
| -0.85006 | 0 |
| -0.845029 | 0 |
| -0.840033 | 0 |
| -0.835039 | 0 |
| -0.830043 | 0 |
| -0.825047 | 0 |
| -0.820019 | 0 |
| -0.815023 | 0 |
| -0.810027 | 0 |
| -0.805029 | 0 |
| -0.800004 | 0 |
| -0.795013 | 0 |
| -0.790019 | 0 |
| -0.785029 | 0 |
| -0.780033 | 0 |
| -0.775009 | 0 |
| -0.770021 | 0 |
| -0.765028 | 0 |
| -0.760035 | 0 |
| -0.755043 | 0 |
| -0.750017 | 0 |
| -0.745024 | 0 |
| -0.74003 | 0 |
| -0.735041 | 0 |
| -0.730014 | 0 |
| -0.72502 | 0 |
| -0.720031 | 0 |
| -0.715038 | 0 |
| -0.710045 | 0 |
| -0.705018 | 0 |
| -0.700031 | 0 |
| -0.695035 | 0 |
| -0.690043 | 0 |
| -0.68502 | 0 |
| -0.680025 | 0 |
| -0.675033 | 0 |
| -0.670036 | 0 |
| -0.665042 | 0 |
| -0.660014 | 0 |
| -0.655019 | 0 |
| -0.650028 | 0 |
| -0.645033 | 0 |
| -0.640035 | 0 |
| -0.635014 | 0 |
| -0.630018 | 0 |
| -0.625023 | 0 |
| -0.620028 | 0 |
| -0.615001 | 0 |
| -0.610005 | 0 |
| -0.605011 | 0 |
| -0.600018 | 0 |
| -0.595025 | 0 |
| -0.589997 | 0 |
| -0.585002 | 0 |
| -0.580008 | 0 |
| -0.575015 | 0 |
| -0.570018 | 0 |
| -0.564997 | 0 |
| -0.559999 | 0 |
| -0.555004 | 0 |
| -0.550012 | 0 |
| -0.544984 | 0 |
| -0.53999 | 0 |
| -0.534994 | 0 |
| -0.530002 | 0 |
| -0.525011 | 0 |
| -0.519987 | 0 |
| -0.514997 | 0 |
| -0.510006 | 0 |
| -0.505011 | 0 |
| -0.499991 | 0 |
| -0.495 | 0 |
| -0.490009 | 0 |
| -0.485018 | 0 |
| -0.480028 | 0 |
| -0.475 | 0 |
| -0.470009 | 0 |
| -0.465021 | 0 |
| -0.460028 | 0 |
| -0.455038 | 0 |
| -0.450011 | 0 |
| -0.445021 | 0 |
| -0.440029 | 0 |
| -0.435036 | 0 |
| -0.430018 | 0 |
| -0.425025 | 0 |
| -0.420031 | 0 |
| -0.415041 | 0 |
| -0.41005 | 0 |
| -0.405025 | 0 |
| -0.400031 | 0 |
| -0.395035 | 0 |
| -0.390042 | 0 |
| -0.385048 | 0 |
| -0.380022 | 0 |
| -0.375028 | 0 |
| -0.370035 | 0 |
| -0.365042 | 0 |
| -0.360016 | 0 |
| -0.355024 | 0 |
| -0.350027 | 0 |
| -0.345036 | 0 |
| -0.340041 | 0 |
| -0.335013 | 0 |
| -0.330022 | 0 |
| -0.325027 | 0 |
| -0.320034 | 0 |
| -0.315006 | 0 |
| -0.310011 | 0 |
| -0.305018 | 0 |
| -0.300024 | 0 |
| -0.295034 | 0 |
| -0.290008 | 0 |
| -0.285013 | 0 |
| -0.280019 | 0 |
| -0.275026 | 0 |
| -0.270031 | 0 |
| -0.265003 | 0 |
| -0.260013 | 0 |
| -0.255017 | 0 |
| -0.250026 | 0 |
| -0.245004 | 0 |
| -0.240011 | 0 |
| -0.235019 | 0 |
| -0.230026 | 0 |
| -0.225037 | 0 |
| -0.220013 | 0 |
| -0.21502 | 0 |
| -0.209985 | 0 |
| -0.204991 | 0 |
| -0.199992 | 0 |
| -0.194993 | 0 |
| -0.18999 | 0 |
| -0.184992 | 0 |
| -0.179994 | 0 |
| -0.174999 | 0 |
| -0.169997 | 0 |
| -0.164997 | 0 |
| -0.159993 | 0 |
| -0.154998 | 0 |
| -0.150002 | 0 |
| -0.145007 | 0 |
| -0.140008 | 0 |
| -0.135005 | 0 |
| -0.130008 | 0 |
| -0.125006 | 0 |
| -0.120009 | 0 |
| -0.115005 | 0 |
| -0.110004 | 0 |
| -0.104999 | 0 |
| -0.100002 | 0 |
| -0.095001 | 0 |
| -0.090003 | 0 |
| -0.084997 | 0 |
| -0.079996 | 0 |
| -0.074993 | 0 |
| -0.069995 | 0 |
| -0.064994 | 0 |
| -0.059993 | 0 |
| -0.054994 | 0 |
| -0.049992 | 0 |
| -0.044995 | 0 |
| -0.039994 | 0 |
| -0.034996 | 0 |
| -0.029995 | 0 |
| -0.024995 | 0 |
| -0.019994 | 0 |
| -0.014996 | 0 |
| -0.009995 | 0 |
| -0.004995 | 0 |
| 7e-06 | 0 |
| 0.005004 | 0 |
| 0.010009 | 0 |
| 0.015006 | 0 |
| 0.020008 | 0 |
| 0.025004 | 0 |
| 0.030006 | 0 |
| 0.035005 | 0 |
| 0.040008 | 0 |
| 0.045004 | 0 |
| 0.050003 | 0 |
| 0.055003 | 0 |
| 0.060006 | 0 |
| 0.065006 | 0 |
| 0.070007 | 0 |
| 0.075004 | 0 |
| 0.080007 | 0 |
| 0.085009 | 0 |
| 0.090013 | 0 |
| 0.095011 | 0 |
| 0.100013 | 0 |
| 0.10501 | 0 |
| 0.110014 | 0 |
| 0.115015 | 0 |
| 0.120018 | 0 |
| 0.125016 | 0 |
| 0.130017 | 0 |
| 0.135015 | 0 |
| 0.140016 | 0 |
| 0.145016 | 0 |
| 0.150014 | 0 |
| 0.155008 | 0 |
| 0.160006 | 0 |
| 0.165005 | 0 |
| 0.170008 | 0 |
| 0.17501 | 0 |
| 0.180005 | 0 |
| 0.185004 | 0 |
| 0.19 | 0 |
| 0.195004 | 0 |
| 0.200003 | 0 |
| 0.205001 | 0 |
| 0.209996 | 0 |
| 0.21502 | 0 |
| 0.220013 | 0 |
| 0.225037 | 0 |
| 0.230025 | 0 |
| 0.235019 | 0 |
| 0.24001 | 0 |
| 0.245001 | 0 |
| 0.250024 | 0 |
| 0.255016 | 0 |
| 0.26001 | 0 |
| 0.265 | 0 |
| 0.270027 | 0 |
| 0.275022 | 0 |
| 0.280014 | 0 |
| 0.28501 | 0 |
| 0.290003 | 0 |
| 0.295029 | 0 |
| 0.30002 | 0 |
| 0.305011 | 0 |
| 0.310005 | 0 |
| 0.315032 | 0 |
| 0.320026 | 0 |
| 0.325019 | 0 |
| 0.330014 | 0 |
| 0.335004 | 0 |
| 0.340033 | 0 |
| 0.345027 | 0 |
| 0.350019 | 0 |
| 0.355012 | 0 |
| 0.360041 | 0 |
| 0.365032 | 0 |
| 0.370024 | 0 |
| 0.375016 | 0 |
| 0.38001 | 0 |
| 0.385035 | 0 |
| 0.390029 | 0 |
| 0.395026 | 0 |
| 0.400018 | 0 |
| 0.405011 | 0 |
| 0.410036 | 0 |
| 0.415027 | 0 |
| 0.420016 | 0 |
| 0.425012 | 0 |
| 0.430037 | 0 |
| 0.435022 | 0 |
| 0.440014 | 0 |
| 0.445004 | 0 |
| 0.449996 | 0 |
| 0.455022 | 0 |
| 0.460012 | 0 |
| 0.465004 | 0 |
| 0.469991 | 0 |
| 0.475017 | 0 |
| 0.480011 | 0 |
| 0.484999 | 0 |
| 0.48999 | 0 |
| 0.494983 | 0 |
| 0.500006 | 0 |
| 0.504995 | 0 |
| 0.509987 | 0 |
| 0.514977 | 0 |
| 0.52 | 0 |
| 0.52499 | 0 |
| 0.529981 | 0 |
| 0.534974 | 0 |
| 0.539968 | 0 |
| 0.544995 | 0 |
| 0.54999 | 0 |
| 0.554981 | 0 |
| 0.559979 | 0 |
| 0.565007 | 0 |
| 0.569995 | 0 |
| 0.574991 | 0 |
| 0.579985 | 0 |
| 0.58498 | 0 |
| 0.590008 | 0 |
| 0.595 | 0 |
| 0.599994 | 0 |
| 0.604987 | 0 |
| 0.610014 | 0 |
| 0.615012 | 0 |
| 0.620004 | 0 |
| 0.624999 | 0 |
| 0.629993 | 0 |
| 0.63502 | 0 |
| 0.64001 | 0 |
| 0.645006 | 0 |
| 0.650001 | 0 |
| 0.655025 | 0 |
| 0.660022 | 0 |
| 0.665014 | 0 |
| 0.670009 | 0 |
| 0.675006 | 0 |
| 0.68003 | 0 |
| 0.685025 | 0 |
| 0.690016 | 0 |
| 0.695007 | 0 |
| 0.700002 | 0 |
| 0.705022 | 0 |
| 0.710016 | 0 |
| 0.715009 | 0 |
| 0.72 | 0 |
| 0.725022 | 0 |
| 0.730018 | 0 |
| 0.73501 | 0 |
| 0.74 | 0 |
| 0.744992 | 0 |
| 0.750017 | 0 |
| 0.755011 | 0 |
| 0.760003 | 0 |
| 0.764996 | 0 |
| 0.770022 | 0 |
| 0.775009 | 0 |
| 0.78 | 0 |
| 0.784996 | 0 |
| 0.789985 | 0 |
| 0.795012 | 0 |
| 0.800004 | 0 |
| 0.804994 | 0 |
| 0.809993 | 0 |
| 0.815021 | 0 |
| 0.820016 | 0 |
| 0.825013 | 0 |
| 0.830009 | 0 |
| 0.835004 | 0 |
| 0.84003 | 0 |
| 0.845027 | 0 |
| 0.850024 | 0 |
| 0.855018 | 0 |
| 0.860046 | 0 |
| 0.865044 | 0 |
| 0.87004 | 0 |
| 0.875031 | 0 |
| 0.880029 | 0 |
| 0.885058 | 0 |
| 0.890054 | 0 |
| 0.89505 | 0 |
| 0.900046 | 0 |
| 0.905076 | 0 |
| 0.910065 | 0 |
| 0.915062 | 0 |
| 0.920061 | 0 |
| 0.925054 | 0 |
| 0.930084 | 0 |
| 0.93508 | 0 |
| 0.940075 | 0 |
| 0.945069 | 0 |
| 0.950098 | 0 |
| 0.95509 | 0 |
| 0.960081 | 0 |
| 0.965075 | 0 |
| 0.970066 | 0 |
| 0.975088 | 0 |
| 0.980082 | 0 |
| 0.985075 | 0 |
| 0.990067 | 0 |
| 0.995089 | 0 |
| 1.000082 | 0 |
| 1.005077 | 0 |
| 1.010066 | 0 |
| 1.015059 | 0 |
| 1.020085 | 0 |
| 1.025076 | 0 |
| 1.03007 | 0 |
| 1.035061 | 0 |
| 1.040054 | 0 |
| 1.045074 | 0 |
| 1.050068 | 0 |
| 1.055058 | 0 |
| 1.060051 | 0 |
| 1.065076 | 0 |
| 1.070069 | 0 |
| 1.075061 | 0 |
| 1.080053 | 0 |
| 1.085053 | 0 |
| 1.090081 | 0 |
| 1.095074 | 0 |
| 1.10007 | 0 |
| 1.105066 | 0 |
| 1.110093 | 0 |
| 1.115088 | 0 |
| 1.120085 | 0 |
| 1.12508 | 0 |
| 1.130074 | 0 |
| 1.135102 | 0 |
| 1.140101 | 0 |
| 1.145094 | 0 |
| 1.15009 | 0 |
| 1.155119 | 0 |
| 1.160113 | 0 |
| 1.165108 | 0 |
| 1.170106 | 0 |
| 1.175101 | 0 |
| 1.180127 | 0 |
| 1.185122 | 0 |
| 1.190118 | 0 |
| 1.195115 | 0 |
| 1.200142 | 0 |
| 1.205137 | 0 |
| 1.210135 | 0 |
| 1.215129 | 0 |
| 1.220121 | 0 |
| 1.225149 | 0 |
| 1.230139 | 0 |
| 1.235131 | 0 |
| 1.240125 | 0 |
| 1.245147 | 0 |
| 1.250139 | 0 |
| 1.25513 | 0 |
| 1.260122 | 0 |
| 1.265114 | 0 |
| 1.270137 | 0 |
| 1.275128 | 0 |
| 1.28012 | 0 |
| 1.285112 | 0 |
| 1.290138 | 0 |
| 1.29513 | 0 |
| 1.300119 | 0 |
| 1.305114 | 0 |
| 1.310106 | 0 |
| 1.315126 | 0 |
| 1.320117 | 0 |
| 1.325109 | 0 |
| 1.330099 | 0 |
| 1.335093 | 0 |
| 1.340118 | 0 |
| 1.345108 | 0 |
| 1.350103 | 0 |
| 1.355093 | 0 |
| 1.360126 | 0 |
| 1.365117 | 0 |
| 1.370111 | 0 |
| 1.375107 | 0 |
| 1.380098 | 0 |
| 1.385121 | 0 |
| 1.390118 | 0 |
| 1.395111 | 0 |
| 1.400103 | 0 |
| 1.405131 | 0 |
| 1.410124 | 0 |
| 1.415116 | 0 |
| 1.420112 | 0 |
| 1.425105 | 0 |
| 1.430134 | 0 |
| 1.435126 | 0 |
| 1.44012 | 0 |
| 1.445117 | 0 |
| 1.450138 | 0 |
| 1.455131 | 0 |
| 1.460126 | 0 |
| 1.46512 | 0 |
| 1.470114 | 0 |
| 1.475143 | 0 |
| 1.480134 | 0 |
| 1.485128 | 0 |
| 1.490116 | 0 |
| 1.495138 | 0 |
| 1.500127 | 0 |
| 1.505117 | 0 |
| 1.510104 | 0 |
| 1.515093 | 0 |
| 1.52011 | 0 |
| 1.525101 | 0 |
| 1.530092 | 0 |
| 1.535075 | 0 |
| 1.540099 | 0 |
| 1.545087 | 0 |
| 1.550074 | 0 |
| 1.555064 | 0 |
| 1.560051 | 0 |
| 1.565073 | 0 |
| 1.57006 | 0 |
| 1.575046 | 0 |
| 1.580038 | 0 |
| 1.585056 | 0 |
| 1.590042 | 0 |
| 1.595033 | 0 |
| 1.60002 | 0 |
| 1.605005 | 0 |
| 1.61003 | 0 |
| 1.615017 | 0 |
| 1.620007 | 0 |
| 1.625002 | 0 |
| 1.629998 | 0 |
| 1.635024 | 0 |
| 1.64002 | 0 |
| 1.645013 | 0 |
| 1.650009 | 0 |
| 1.655032 | 0 |
| 1.660025 | 0 |
| 1.665022 | 0 |
| 1.670014 | 0 |
| 1.675009 | 0 |
| 1.680037 | 0 |
| 1.68503 | 0 |
| 1.690025 | 0 |
| 1.695019 | 0 |
| 1.700046 | 0 |
| 1.70504 | 0 |
| 1.710035 | 0 |
| 1.715028 | 0 |
| 1.720021 | 0 |
| 1.725049 | 0 |
| 1.730043 | 0 |
| 1.735039 | 0 |
| 1.740031 | 0 |
| 1.74506 | 0 |
| 1.750055 | 0 |
| 1.755048 | 0 |
| 1.760041 | 0 |
| 1.76503 | 0 |
| 1.770054 | 0 |
| 1.775044 | 0 |
| 1.780034 | 0 |
| 1.785023 | 0 |
| 1.790044 | 0 |
| 1.795033 | 0 |
| 1.800023 | 0 |
| 1.805014 | 0 |
| 1.810006 | 0 |
| 1.815027 | 0 |
| 1.820018 | 0 |
| 1.825005 | 0 |
| 1.829997 | 0 |
| 1.83502 | 0 |
| 1.840008 | 0 |
| 1.844998 | 0 |
| 1.849988 | 0 |
| 1.854978 | 0 |
| 1.86 | 0 |
| 1.864988 | 0 |
| 1.86998 | 0 |
| 1.874968 | 0 |
| 1.879989 | 0 |
| 1.884983 | 0 |
| 1.889971 | 0 |
| 1.894967 | 0 |
| 1.899961 | 0 |
| 1.904987 | 0 |
| 1.90998 | 0 |
| 1.914975 | 0 |
| 1.919969 | 0 |
| 1.924959 | 0 |
| 1.929986 | 0 |
| 1.934976 | 0 |
| 1.939974 | 0 |
| 1.944967 | 0 |
| 1.949994 | 0 |
| 1.954989 | 0 |
| 1.959979 | 0 |
| 1.964973 | 0 |
| 1.969969 | 0 |
| 1.974994 | 0 |
| 1.97999 | 0 |
| 1.984984 | 0 |
| 1.989975 | 0 |
| 1.995002 | 0 |
| 1.999995 | 0 |
| 2.004987 | 0 |
| 2.009979 | 0 |
| 2.014974 | 0 |
| 2.020001 | 0 |
| 2.024998 | 0 |
| 2.02999 | 0 |
| 2.03498 | 0 |
| 2.040002 | 0 |
| 2.044992 | 0 |
| 2.049983 | 0 |
| 2.054973 | 0 |
| 2.059958 | 0 |
| 2.064982 | 0 |
| 2.069971 | 0 |
| 2.074961 | 0 |
| 2.079952 | 0 |
| 2.084974 | 0 |
| 2.089963 | 0 |
| 2.094951 | 0 |
| 2.099942 | 0 |
| 2.105365 | 0 |
| 2.110334 | 0 |
| 2.115284 | 0 |
| 2.120234 | 0 |
| 2.125193 | 0 |
| 2.130161 | 0 |
| 2.135109 | 0 |
| 2.140399 | 0 |
| 2.145353 | 0 |
| 2.15032 | 0 |
| 2.155275 | 0 |
| 2.160228 | 0 |
| 2.165181 | 0 |
| 2.17013 | 0 |
| 2.175126 | 0 |
| 2.180414 | 0 |
| 2.185366 | 0 |
| 2.190316 | 0 |
| 2.195284 | 0 |
| 2.200235 | 0 |
| 2.205189 | 0 |
| 2.210144 | 0 |
| 2.215129 | 0 |
| 2.220417 | 0 |
| 2.225374 | 0 |
| 2.230322 | 0 |
| 2.235292 | 0 |
| 2.240252 | 0 |
| 2.245203 | 0 |
| 2.250149 | 0 |
| 2.255104 | 0 |
| 2.260421 | 0 |
| 2.265376 | 0 |
| 2.270329 | 0 |
| 2.275284 | 0 |
| 2.280256 | 0 |
| 2.285209 | 0 |
| 2.290151 | 0 |
| 2.295101 | 0 |
| 2.300037 | 0 |
| 2.30533 | 0 |
| 2.310284 | 0 |
| 2.315243 | 0 |
| 2.320205 | 0 |
| 2.325162 | 0 |
| 2.330111 | 0 |
| 2.335066 | 0 |
| 2.340021 | 0 |
| 2.345338 | 0 |
| 2.350295 | 0 |
| 2.355251 | 0 |
| 2.360203 | 0 |
| 2.365174 | 0 |
| 2.370129 | 0 |
| 2.375075 | 0 |
| 2.380032 | 0 |
| 2.385345 | 0 |
| 2.390302 | 0 |
| 2.395255 | 0 |
| 2.400216 | 0 |
| 2.405185 | 0 |
| 2.410142 | 0 |
| 2.415095 | 0 |
| 2.420044 | 0 |
| 2.425356 | 0 |
| 2.430315 | 0 |
| 2.435265 | 0 |
| 2.440224 | 0 |
| 2.445179 | 0 |
| 2.450136 | 0 |
| 2.455092 | 0 |
| 2.460044 | 0 |
| 2.464991 | 0 |
| 2.470278 | 0 |
| 2.475241 | 0 |
| 2.480201 | 0 |
| 2.485157 | 0 |
| 2.490124 | 0 |
| 2.495075 | 0 |
| 2.500027 | 0 |
| 2.504977 | 0 |
| 2.510295 | 0 |
| 2.515258 | 0 |
| 2.520212 | 0 |
| 2.525171 | 0 |
| 2.530123 | 0 |
| 2.53509 | 0 |
| 2.540045 | 0 |
| 2.544993 | 0 |
| 2.55027 | 0 |
| 2.555252 | 0 |
| 2.560212 | 0 |
| 2.565172 | 0 |
| 2.570117 | 0 |
| 2.575089 | 0 |
| 2.580047 | 0 |
| 2.584986 | 0 |
| 2.59028 | 0 |
| 2.595274 | 0 |
| 2.60023 | 0 |
| 2.605197 | 0 |
| 2.610139 | 0 |
| 2.615088 | 0 |
| 2.620053 | 0 |
| 2.625003 | 0 |
| 2.629966 | 0 |
| 2.635248 | 0 |
| 2.640219 | 0 |
| 2.64518 | 0 |
| 2.650133 | 0 |
| 2.655088 | 0 |
| 2.660066 | 0 |
| 2.665023 | 0 |
| 2.669981 | 0 |
| 2.675258 | 0 |
| 2.680259 | 0 |
| 2.685228 | 0 |
| 2.690166 | 0 |
| 2.695126 | 0 |
| 2.700084 | 0 |
| 2.705061 | 0 |
| 2.710009 | 0 |
| 2.7153 | 0 |
| 2.72025 | 0 |
| 2.725237 | 0 |
| 2.730208 | 0 |
| 2.735157 | 0 |
| 2.740119 | 0 |
| 2.745085 | 0 |
| 2.75004 | 0 |
| 2.754994 | 0 |
| 2.760286 | 0 |
| 2.765269 | 0 |
| 2.770227 | 0 |
| 2.775171 | 0 |
| 2.780141 | 0 |
| 2.785105 | 0 |
| 2.790066 | 0 |
| 2.795022 | 0 |
| 2.800305 | 0 |
| 2.805258 | 0 |
| 2.810225 | 0 |
| 2.815185 | 0 |
| 2.82014 | 0 |
| 2.825104 | 0 |
| 2.830068 | 0 |
| 2.835028 | 0 |
| 2.840317 | 0 |
| 2.845259 | 0 |
| 2.850259 | 0 |
| 2.855213 | 0 |
| 2.860166 | 0 |
| 2.865121 | 0 |
| 2.870094 | 0 |
| 2.875058 | 0 |
| 2.88034 | 0 |
| 2.885288 | 0 |
| 2.890251 | 0 |
| 2.895231 | 0 |
| 2.900196 | 0 |
| 2.905164 | 0 |
| 2.910113 | 0 |
| 2.915085 | 0 |
| 2.920038 | 0 |
| 2.925323 | 0 |
| 2.930284 | 0 |
| 2.935276 | 0 |
| 2.940235 | 0 |
| 2.945193 | 0 |
| 2.950146 | 0 |
| 2.955119 | 0 |
| 2.960071 | 0 |
| 2.965346 | 0 |
| 2.970311 | 0 |
| 2.975266 | 0 |
| 2.980204 | 0 |
| 2.985164 | 0 |
| 2.990118 | 0 |
| 2.99508 | 0 |
| 3.000053 | 0 |
| 3.005339 | 0 |
| 3.010293 | 0 |
| 3.015247 | 0 |
| 3.020244 | 0 |
| 3.0252 | 0 |
| 3.030154 | 0 |
| 3.035115 | 0 |
| 3.040072 | 0 |
| 3.045376 | 0 |
| 3.05033 | 0 |
| 3.055288 | 0 |
| 3.060267 | 0 |
| 3.065229 | 0 |
| 3.070182 | 0 |
| 3.075153 | 0 |
| 3.080104 | 0 |
| 3.085063 | 0 |
| 3.090358 | 0 |
| 3.095315 | 0 |
| 3.100269 | 0 |
| 3.105261 | 0 |
| 3.110224 | 0 |
| 3.115171 | 0 |
| 3.120132 | 0 |
| 3.125103 | 0 |
| 3.130397 | 0 |
| 3.135346 | 0 |
| 3.140311 | 0 |
| 3.145278 | 0 |
| 3.150222 | 0 |
| 3.15519 | 0 |
| 3.160148 | 0 |
| 3.165096 | 0 |
| 3.170402 | 0 |
| 3.175363 | 0 |
| 3.180315 | 0 |
| 3.185279 | 0 |
| 3.190271 | 0 |
| 3.195224 | 0 |
| 3.200192 | 0 |
| 3.205142 | 0 |
| 3.210453 | 0 |
| 3.215411 | 0 |
| 3.220367 | 0 |
| 3.225308 | 0 |
| 3.230298 | 0 |
| 3.235262 | 0 |
| 3.240224 | 0 |
| 3.24517 | 0 |
| 3.250134 | 0 |
| 3.255429 | 0 |
| 3.26039 | 0 |
| 3.265347 | 0 |
| 3.270303 | 0 |
| 3.275306 | 0 |
| 3.280259 | 0 |
| 3.285216 | 0 |
| 3.290169 | 0 |
| 3.29547 | 0 |
| 3.30043 | 0 |
| 3.305391 | 0 |
| 3.310351 | 0 |
| 3.315303 | 0 |
| 3.320274 | 0 |
| 3.325222 | 0 |
| 3.330189 | 0 |
| 3.335493 | 0 |
| 3.34045 | 0 |
| 3.345406 | 0 |
| 3.350366 | 0 |
| 3.355326 | 0 |
| 3.360321 | 0 |
| 3.365273 | 0 |
| 3.370233 | 0 |
| 3.375188 | 0 |
| 3.380494 | 0 |
| 3.385445 | 0 |
| 3.390409 | 0 |
| 3.395362 | 0 |
| 3.400349 | 0 |
| 3.405313 | 0 |
| 3.410261 | 0 |
| 3.415236 | 0 |
| 3.420373 | 0 |
| 3.425338 | 0 |
| 3.430296 | 0 |
| 3.435246 | 0 |
| 3.440201 | 0 |
| 3.445191 | 0 |
| 3.450149 | 0 |
| 3.455098 | 0 |
| 3.460389 | 0 |
| 3.465358 | 0 |
| 3.470316 | 0 |
| 3.475258 | 0 |
| 3.480226 | 0 |
| 3.485192 | 0 |
| 3.490152 | 0 |
| 3.495107 | 0 |
| 3.500395 | 0 |
| 3.505366 | 0 |
| 3.510323 | 0 |
| 3.515277 | 0 |
| 3.520234 | 0 |
| 3.525177 | 0 |
| 3.530177 | 0 |
| 3.535126 | 0 |
| 3.540083 | 0 |
| 3.545371 | 0 |
| 3.550353 | 0 |
| 3.555304 | 0 |
| 3.560258 | 0 |
| 3.565214 | 0 |
| 3.570199 | 0 |
| 3.575173 | 0 |
| 3.580126 | 0 |
| 3.585407 | 0 |
| 3.590381 | 0 |
| 3.59533 | 0 |
| 3.600289 | 0 |
| 3.605248 | 0 |
| 3.610202 | 0 |
| 3.615197 | 0 |
| 3.620151 | 0 |
| 3.625442 | 0 |
| 3.630381 | 0 |
| 3.635358 | 0 |
| 3.640313 | 0 |
| 3.645268 | 0 |
| 3.650239 | 0 |
| 3.655163 | 0 |
| 3.660124 | 0 |
| 3.665404 | 0 |
| 3.670361 | 0 |
| 3.675337 | 0 |
| 3.680295 | 0 |
| 3.685247 | 0 |
| 3.690207 | 0 |
| 3.695198 | 0 |
| 3.700162 | 0 |
| 3.705113 | 0 |
| 3.710405 | 0 |
| 3.715362 | 0 |
| 3.72033 | 0 |
| 3.725283 | 0 |
| 3.730241 | 0 |
| 3.735197 | 0 |
| 3.74018 | 0 |
| 3.745145 | 0 |
| 3.750433 | 0 |
| 3.755395 | 0 |
| 3.760363 | 0 |
| 3.765316 | 0 |
| 3.770276 | 0 |
| 3.775228 | 0 |
| 3.780221 | 0 |
| 3.78519 | 0 |
| 3.790465 | 0 |
| 3.795422 | 0 |
| 3.80038 | 0 |
| 3.805346 | 0 |
| 3.8103 | 0 |
| 3.815262 | 0 |
| 3.820215 | 0 |
| 3.825181 | 0 |
| 3.830146 | 0 |
| 3.835427 | 0 |
| 3.84038 | 0 |
| 3.845353 | 0 |
| 3.850313 | 0 |
| 3.85527 | 0 |
| 3.860231 | 0 |
| 3.86522 | 0 |
| 3.870183 | 0 |
| 3.875474 | 0 |
| 3.880429 | 0 |
| 3.885394 | 0 |
| 3.890348 | 0 |
| 3.895304 | 0 |
| 3.900266 | 0 |
| 3.905217 | 0 |
| 3.910211 | 0 |
| 3.915498 | 0 |
| 3.920447 | 0 |
| 3.925421 | 0 |
| 3.930388 | 0 |
| 3.935346 | 0 |
| 3.940296 | 0 |
| 3.945265 | 0 |
| 3.950254 | 0 |
| 3.955532 | 0 |
| 3.960492 | 0 |
| 3.965453 | 0 |
| 3.97042 | 0 |
| 3.975376 | 0 |
| 3.980331 | 0 |
| 3.985278 | 0 |
| 3.990254 | 0 |
| 3.995234 | 0 |
| 4.000518 | 0 |
| 4.005479 | 0 |
| 4.010444 | 0 |
| 4.015405 | 0 |
| 4.020371 | 0 |
| 4.025323 | 0 |
| 4.030282 | 0 |
| 4.035266 | 0 |
| 4.040554 | 0 |
| 4.045516 | 0 |
| 4.050469 | 0 |
| 4.055433 | 0 |
| 4.060393 | 0 |
| 4.065346 | 0 |
| 4.0703 | 0 |
| 4.075249 | 0 |
| 4.080578 | 0 |
| 4.085537 | 0 |
| 4.090489 | 0 |
| 4.095443 | 0 |
| 4.100423 | 0 |
| 4.105376 | 0 |
| 4.110326 | 0 |
| 4.115275 | 0 |
| 4.12059 | 0 |
| 4.125559 | 0 |
| 4.13051 | 0 |
| 4.135473 | 0 |
| 4.14044 | 0 |
| 4.145401 | 0 |
| 4.150346 | 0 |
| 4.155293 | 0 |
| 4.160255 | 0 |
| 4.165556 | 0 |
| 4.170521 | 0 |
| 4.175476 | 0 |
| 4.180426 | 0 |
| 4.185396 | 0 |
| 4.190194 | 0 |
| 4.195147 | 0 |
| 4.200097 | 0 |
| 4.205412 | 0 |
| 4.210366 | 0 |
| 4.215328 | 0 |
| 4.220286 | 0 |
| 4.225243 | 0 |
| 4.230194 | 0 |
| 4.235157 | 0 |
| 4.240092 | 0 |
| 4.245395 | 0 |
| 4.250359 | 0 |
| 4.255323 | 0 |
| 4.260281 | 0 |
| 4.265229 | 0 |
| 4.27021 | 0 |
| 4.275155 | 0 |
| 4.280114 | 0 |
| 4.285394 | 0 |
| 4.290374 | 0 |
| 4.295344 | 0 |
| 4.300294 | 0 |
| 4.305246 | 0 |
| 4.310211 | 0 |
| 4.315168 | 0 |
| 4.320111 | 0 |
| 4.32507 | 0 |
| 4.330341 | 0 |
| 4.335296 | 0 |
| 4.340237 | 0 |
| 4.345207 | 0 |
| 4.350169 | 0 |
| 4.355127 | 0 |
| 4.36009 | 0 |
| 4.365048 | 0 |
| 4.370328 | 0 |
| 4.375315 | 0 |
| 4.380269 | 0 |
| 4.38523 | 0 |
| 4.390186 | 0 |
| 4.395154 | 0 |
| 4.400102 | 0 |
| 4.405054 | 0 |
| 4.410339 | 0 |
| 4.41531 | 0 |
| 4.420288 | 0 |
| 4.425229 | 0 |
| 4.430181 | 0 |
| 4.435137 | 0 |
| 4.440114 | 0 |
| 4.445064 | 0 |
| 4.450017 | 0 |
| 4.455297 | 0 |
| 4.460286 | 0 |
| 4.465241 | 0 |
| 4.470199 | 0 |
| 4.475151 | 0 |
| 4.480114 | 0 |
| 4.485075 | 0 |
| 4.490023 | 0 |
| 4.495309 | 0 |
| 4.500249 | 0 |
| 4.505218 | 0 |
| 4.510175 | 0 |
| 4.515127 | 0 |
| 4.520084 | 0 |
| 4.525049 | 0 |
| 4.530015 | 0 |
| 4.535295 | 0 |
| 4.540248 | 0 |
| 4.545238 | 0 |
| 4.550195 | 0 |
| 4.55515 | 0 |
| 4.560099 | 0 |
| 4.565067 | 0 |
| 4.570027 | 0 |
| 4.575306 | 0 |
| 4.580259 | 0 |
| 4.58524 | 0 |
| 4.590202 | 0 |
| 4.595151 | 0 |
| 4.600103 | 0 |
| 4.605075 | 0 |
| 4.610039 | 0 |
| 4.614995 | 0 |
| 4.620269 | 0 |
| 4.625223 | 0 |
| 4.630222 | 0 |
| 4.63518 | 0 |
| 4.640127 | 0 |
| 4.645084 | 0 |
| 4.650039 | 0 |
| 4.654996 | 0 |
| 4.660279 | 0 |
| 4.66523 | 0 |
| 4.670181 | 0 |
| 4.675145 | 0 |
| 4.680093 | 0 |
| 4.685048 | 0 |
| 4.690025 | 0 |
| 4.694985 | 0 |
| 4.700266 | 0 |
| 4.70522 | 0 |
| 4.710173 | 0 |
| 4.715172 | 0 |
| 4.720129 | 0 |
| 4.725082 | 0 |
| 4.730045 | 0 |
| 4.735012 | 0 |
| 4.740298 | 0 |
| 4.745263 | 0 |
| 4.750186 | 0 |
| 4.755182 | 0 |
| 4.760141 | 0 |
| 4.765095 | 0 |
| 4.770049 | 0 |
| 4.775028 | 0 |
| 4.779968 | 0 |
| 4.785265 | 0 |
| 4.790216 | 0 |
| 4.795173 | 0 |
| 4.800163 | 0 |
| 4.805117 | 0 |
| 4.810071 | 0 |
| 4.81503 | 0 |
| 4.819991 | 0 |
| 4.825277 | 0 |
| 4.830231 | 0 |
| 4.835179 | 0 |
| 4.840138 | 0 |
| 4.845098 | 0 |
| 4.850059 | 0 |
| 4.855016 | 0 |
| 4.85998 | 0 |
| 4.865273 | 0 |
| 4.870232 | 0 |
| 4.875186 | 0 |
| 4.880164 | 0 |
| 4.885123 | 0 |
| 4.890083 | 0 |
| 4.895039 | 0 |
| 4.899993 | 0 |
| 4.905289 | 0 |
| 4.910237 | 0 |
| 4.915199 | 0 |
| 4.920156 | 0 |
| 4.925131 | 0 |
| 4.930094 | 0 |
| 4.93505 | 0 |
| 4.940015 | 0 |
| 4.94497 | 0 |
| 4.950264 | 0 |
| 4.955217 | 0 |
| 4.960171 | 0 |
| 4.965159 | 0 |
| 4.970113 | 0 |
| 4.975076 | 0 |
| 4.980029 | 0 |
| 4.984986 | 0 |
| 4.99028 | 0 |
| 4.995238 | 0 |
| 5.000192 | 0 |
| 5.005147 | 0 |
| 5.010093 | 0 |
| 5.015037 | 0 |
| 5.019984 | 0 |
| 5.024952 | 0 |
| 5.030258 | 0 |
| 5.035213 | 0 |
| 5.040166 | 0 |
| 5.045134 | 0 |
| 5.050104 | 0 |
| 5.055071 | 0 |
| 5.060029 | 0 |
| 5.064987 | 0 |
| 5.069765 | 0 |
| 5.075064 | 0 |
| 5.080017 | 0 |
| 5.084965 | 0 |
| 5.089923 | 0 |
| 5.094902 | 0 |
| 5.099856 | 0 |
| 5.104813 | 0 |
| 5.109766 | 0 |
| 5.115055 | 0 |
| 5.120023 | 0 |
| 5.124973 | 0 |
| 5.129925 | 0 |
| 5.134914 | 0 |
| 5.139857 | 0 |
| 5.144823 | 0 |
| 5.149779 | 0 |
| 5.155065 | 0 |
| 5.160028 | 0 |
| 5.164979 | 0 |
| 5.169918 | 0 |
| 5.174871 | 0 |
| 5.179832 | 0 |
| 5.184797 | 0 |
| 5.18975 | 0 |
| 5.195044 | 0 |
| 5.200007 | 0 |
| 5.204965 | 0 |
| 5.209916 | 0 |
| 5.214869 | 0 |
| 5.219856 | 0 |
| 5.224825 | 0 |
| 5.229771 | 0 |
| 5.234726 | 0 |
| 5.24002 | 0 |
| 5.24498 | 0 |
| 5.249935 | 0 |
| 5.254881 | 0 |
| 5.25983 | 0 |
| 5.264824 | 0 |
| 5.269771 | 0 |
| 5.274719 | 0 |
| 5.280014 | 0 |
| 5.284981 | 0 |
| 5.289942 | 0 |
| 5.29488 | 0 |
| 5.299838 | 0 |
| 5.304824 | 0 |
| 5.309782 | 0 |
| 5.314741 | 0 |
| 5.320015 | 0 |
| 5.324987 | 0 |
| 5.329941 | 0 |
| 5.33489 | 0 |
| 5.339839 | 0 |
| 5.344792 | 0 |
| 5.349779 | 0 |
| 5.354732 | 0 |
| 5.36001 | 0 |
| 5.364966 | 0 |
| 5.369952 | 0 |
| 5.374908 | 0 |
| 5.379865 | 0 |
| 5.384819 | 0 |
| 5.389817 | 0 |
| 5.394773 | 0 |
| 5.399723 | 0 |
| 5.405025 | 0 |
| 5.40999 | 0 |
| 5.414941 | 0 |
| 5.419907 | 0 |
| 5.424858 | 0 |
| 5.429821 | 0 |
| 5.434809 | 0 |
| 5.439767 | 0 |
| 5.445035 | 0 |
| 5.450015 | 0 |
| 5.454982 | 0 |
| 5.459938 | 0 |
| 5.46489 | 0 |
| 5.469858 | 0 |
| 5.474849 | 0 |
| 5.479813 | 0 |
| 5.485083 | 0 |
| 5.49005 | 0 |
| 5.495003 | 0 |
| 5.499973 | 0 |
| 5.504919 | 0 |
| 5.509894 | 0 |
| 5.514853 | 0 |
| 5.519822 | 0 |
| 5.525117 | 0 |
| 5.530064 | 0 |
| 5.535029 | 0 |
| 5.540004 | 0 |
| 5.544961 | 0 |
| 5.549922 | 0 |
| 5.554876 | 0 |
| 5.55987 | 0 |
| 5.564826 | 0 |
| 5.570107 | 0 |
| 5.575066 | 0 |
| 5.580039 | 0 |
| 5.585001 | 0 |
| 5.589946 | 0 |
| 5.59491 | 0 |
| 5.5999 | 0 |
| 5.604853 | 0 |
| 5.610141 | 0 |
| 5.615106 | 0 |
| 5.62006 | 0.001 |
| 5.625034 | 0.001 |
| 5.629996 | 0.001 |
| 5.634959 | 0.001 |
| 5.63991 | 0.001 |
| 5.644912 | 0.001 |
| 5.650201 | 0.001 |
| 5.655148 | 0.001 |
| 5.660106 | 0.001 |
| 5.665077 | 0.001 |
| 5.670033 | 0.001 |
| 5.674995 | 0.001 |
| 5.679945 | 0.001 |
| 5.684881 | 0.001 |
| 5.689852 | 0.001 |
| 5.695138 | 0.001 |
| 5.700099 | 0.001 |
| 5.705064 | 0.001 |
| 5.710035 | 0.001 |
| 5.714993 | 0.001 |
| 5.719954 | 0.001 |
| 5.724908 | 0.001 |
| 5.729909 | 0.001 |
| 5.735199 | 0.001 |
| 5.740151 | 0.001 |
| 5.745118 | 0.001 |
| 5.750092 | 0.001 |
| 5.755041 | 0.001 |
| 5.760006 | 0.001 |
| 5.764972 | 0.001 |
| 5.769959 | 0.001 |
| 5.775254 | 0.001 |
| 5.780208 | 0.001 |
| 5.785155 | 0.001 |
| 5.790144 | 0.001 |
| 5.795098 | 0.001 |
| 5.800054 | 0.001 |
| 5.805022 | 0.001 |
| 5.809988 | 0.001 |
| 5.815303 | 0.001 |
| 5.820267 | 0.001 |
| 5.825047 | 0.001 |
| 5.830013 | 0.001 |
| 5.834972 | 0.001 |
| 5.839932 | 0.001 |
| 5.844888 | 0.001 |
| 5.849844 | 0.001 |
| 5.854806 | 0.001 |
| 5.8601 | 0.001 |
| 5.865063 | 0.001 |
| 5.870019 | 0.001 |
| 5.874988 | 0.001 |
| 5.87994 | 0.001 |
| 5.884897 | 0.001 |
| 5.889859 | 0.001 |
| 5.894817 | 0.001 |
| 5.900135 | 0.001 |
| 5.905097 | 0.001 |
| 5.910044 | 0.002 |
| 5.915006 | 0.002 |
| 5.919979 | 0.002 |
| 5.924935 | 0.002 |
| 5.929883 | 0.002 |
| 5.934845 | 0.002 |
| 5.940164 | 0.002 |
| 5.945134 | 0.002 |
| 5.950083 | 0.002 |
| 5.955043 | 0.002 |
| 5.960015 | 0.002 |
| 5.964965 | 0.002 |
| 5.969916 | 0.002 |
| 5.974876 | 0.002 |
| 5.980169 | 0.002 |
| 5.985156 | 0.002 |
| 5.990121 | 0.002 |
| 5.995082 | 0.002 |
| 6.000027 | 0.002 |
| 6.005002 | 0.003 |
| 6.009966 | 0.003 |
| 6.014927 | 0.003 |
| 6.019877 | 0.003 |
| 6.025166 | 0.003 |
| 6.030131 | 0.003 |
| 6.035097 | 0.003 |
| 6.04005 | 0.003 |
| 6.045019 | 0.003 |
| 6.049989 | 0.003 |
| 6.054941 | 0.003 |
| 6.059903 | 0.004 |
| 6.06522 | 0.004 |
| 6.070191 | 0.004 |
| 6.075151 | 0.004 |
| 6.080103 | 0.004 |
| 6.085069 | 0.004 |
| 6.090042 | 0.005 |
| 6.094995 | 0.005 |
| 6.099956 | 0.005 |
| 6.105252 | 0.005 |
| 6.110235 | 0.005 |
| 6.115205 | 0.006 |
| 6.120166 | 0.006 |
| 6.125121 | 0.006 |
| 6.130093 | 0.006 |
| 6.135064 | 0.007 |
| 6.140023 | 0.007 |
| 6.144992 | 0.007 |
| 6.150321 | 0.008 |
| 6.155288 | 0.008 |
| 6.160248 | 0.009 |
| 6.165208 | 0.009 |
| 6.170172 | 0.01 |
| 6.17517 | 0.01 |
| 6.179876 | 0.011 |
| 6.184831 | 0.012 |
| 6.190112 | 0.012 |
| 6.195086 | 0.013 |
| 6.200043 | 0.014 |
| 6.20501 | 0.015 |
| 6.209965 | 0.016 |
| 6.214944 | 0.017 |
| 6.219897 | 0.018 |
| 6.224865 | 0.02 |
| 6.226196 | 0.02 |
| 6.226204 | 0.02 |
| 6.226199 | 0.02 |
| 6.226192 | 0.02 |
| 6.226188 | 0.02 |
| 6.226195 | 0.02 |
| 6.226182 | 0.02 |
| 6.226168 | 0.02 |
| 6.226169 | 0.02 |
| 6.226171 | 0.02 |
| 6.226167 | 0.02 |
| 6.22617 | 0.02 |
| 6.226158 | 0.02 |
| 6.226144 | 0.02 |
| 6.226138 | 0.02 |
| 6.226139 | 0.02 |
| 6.226127 | 0.02 |
| 6.226137 | 0.02 |
| 6.226141 | 0.02 |
| 6.226138 | 0.02 |
| 6.226127 | 0.02 |
| 6.226123 | 0.02 |
| 6.226123 | 0.02 |
| 6.22613 | 0.02 |
| 6.226111 | 0.02 |
| 6.226119 | 0.02 |
| 6.226109 | 0.02 |
| 6.226113 | 0.02 |
| 6.226106 | 0.02 |
| 6.226113 | 0.02 |
| 6.226103 | 0.02 |
| 6.226101 | 0.02 |
| 6.226103 | 0.02 |
| 6.226094 | 0.02 |
| 6.226086 | 0.02 |
| 6.226075 | 0.02 |
| 6.226081 | 0.02 |
| 6.226069 | 0.02 |
| 6.226073 | 0.02 |
| 6.226052 | 0.02 |
| 6.226072 | 0.02 |
| 6.226069 | 0.02 |
| 6.226057 | 0.02 |
| 6.226047 | 0.02 |
| 6.226059 | 0.02 |
| 6.226048 | 0.02 |
| 6.226046 | 0.02 |
| 6.226039 | 0.02 |
| 6.226024 | 0.02 |
| 6.226028 | 0.02 |
| 6.226024 | 0.02 |
| 6.226027 | 0.02 |
| 6.226014 | 0.02 |
| 6.226007 | 0.02 |
| 6.226004 | 0.02 |
| 6.225999 | 0.02 |
| 6.226003 | 0.02 |
| 6.225999 | 0.02 |
| 6.225988 | 0.02 |
| 6.225982 | 0.02 |
| 6.225988 | 0.02 |
| 6.225992 | 0.02 |
| 6.225978 | 0.02 |
| 6.225966 | 0.02 |
| 6.225972 | 0.02 |
| 6.225971 | 0.02 |
| 6.225967 | 0.02 |
| 6.225972 | 0.02 |
| 6.225961 | 0.02 |
| 6.225953 | 0.02 |